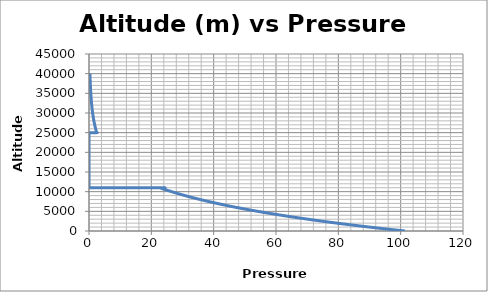
| Category | Series 0 |
|---|---|
| 101.40093090454886 | 0 |
| 101.28094498487972 | 10 |
| 101.16107405590193 | 20 |
| 101.04131803328688 | 30 |
| 100.92167683274836 | 40 |
| 100.80215037004369 | 50 |
| 100.68273856097235 | 60 |
| 100.56344132137707 | 70 |
| 100.44425856714335 | 80 |
| 100.32519021419927 | 90 |
| 100.20623617851601 | 100 |
| 100.08739637610712 | 110 |
| 99.96867072302925 | 120 |
| 99.85005913538177 | 130 |
| 99.73156152930656 | 140 |
| 99.61317782098857 | 150 |
| 99.49490792665505 | 160 |
| 99.37675176257623 | 170 |
| 99.25870924506508 | 180 |
| 99.14078029047698 | 190 |
| 99.02296481521033 | 200 |
| 98.90526273570573 | 210 |
| 98.78767396844674 | 220 |
| 98.67019842995971 | 230 |
| 98.5528360368131 | 240 |
| 98.43558670561848 | 250 |
| 98.31845035302948 | 260 |
| 98.20142689574286 | 270 |
| 98.08451625049776 | 280 |
| 97.96771833407557 | 290 |
| 97.85103306330072 | 300 |
| 97.73446035503963 | 310 |
| 97.61800012620178 | 320 |
| 97.50165229373893 | 330 |
| 97.38541677464511 | 340 |
| 97.26929348595722 | 350 |
| 97.15328234475433 | 360 |
| 97.03738326815814 | 370 |
| 96.92159617333286 | 380 |
| 96.8059209774848 | 390 |
| 96.69035759786307 | 400 |
| 96.57490595175894 | 410 |
| 96.45956595650632 | 420 |
| 96.34433752948117 | 430 |
| 96.2292205881021 | 440 |
| 96.11421504983004 | 450 |
| 95.99932083216812 | 460 |
| 95.884537852662 | 470 |
| 95.76986602889967 | 480 |
| 95.65530527851104 | 490 |
| 95.54085551916901 | 500 |
| 95.42651666858806 | 510 |
| 95.31228864452552 | 520 |
| 95.19817136478045 | 530 |
| 95.08416474719468 | 540 |
| 94.9702687096521 | 550 |
| 94.85648317007858 | 560 |
| 94.74280804644248 | 570 |
| 94.62924325675436 | 580 |
| 94.51578871906683 | 590 |
| 94.40244435147488 | 600 |
| 94.28921007211535 | 610 |
| 94.1760857991676 | 620 |
| 94.06307145085282 | 630 |
| 93.95016694543456 | 640 |
| 93.83737220121853 | 650 |
| 93.72468713655218 | 660 |
| 93.61211166982548 | 670 |
| 93.49964571947021 | 680 |
| 93.38728920396035 | 690 |
| 93.27504204181203 | 700 |
| 93.16290415158309 | 710 |
| 93.0508754518738 | 720 |
| 92.93895586132614 | 730 |
| 92.82714529862429 | 740 |
| 92.71544368249451 | 750 |
| 92.60385093170464 | 760 |
| 92.49236696506507 | 770 |
| 92.3809917014276 | 780 |
| 92.26972505968635 | 790 |
| 92.15856695877736 | 800 |
| 92.04751731767823 | 810 |
| 91.93657605540906 | 820 |
| 91.82574309103128 | 830 |
| 91.71501834364858 | 840 |
| 91.60440173240647 | 850 |
| 91.49389317649215 | 860 |
| 91.38349259513498 | 870 |
| 91.27319990760576 | 880 |
| 91.16301503321743 | 890 |
| 91.05293789132473 | 900 |
| 90.94296840132402 | 910 |
| 90.83310648265376 | 920 |
| 90.72335205479375 | 930 |
| 90.61370503726593 | 940 |
| 90.50416534963395 | 950 |
| 90.39473291150301 | 960 |
| 90.28540764252033 | 970 |
| 90.17618946237448 | 980 |
| 90.06707829079602 | 990 |
| 89.95807404755735 | 1000 |
| 89.84917665247204 | 1010 |
| 89.7403860253959 | 1020 |
| 89.63170208622586 | 1030 |
| 89.52312475490096 | 1040 |
| 89.4146539514018 | 1050 |
| 89.30628959575026 | 1060 |
| 89.19803160801028 | 1070 |
| 89.08987990828695 | 1080 |
| 88.9818344167274 | 1090 |
| 88.87389505352017 | 1100 |
| 88.76606173889513 | 1110 |
| 88.65833439312406 | 1120 |
| 88.55071293652004 | 1130 |
| 88.44319728943776 | 1140 |
| 88.33578737227357 | 1150 |
| 88.22848310546496 | 1160 |
| 88.1212844094913 | 1170 |
| 88.01419120487314 | 1180 |
| 87.90720341217272 | 1190 |
| 87.80032095199374 | 1200 |
| 87.69354374498106 | 1210 |
| 87.5868717118213 | 1220 |
| 87.48030477324228 | 1230 |
| 87.37384285001336 | 1240 |
| 87.26748586294536 | 1250 |
| 87.16123373289012 | 1260 |
| 87.05508638074141 | 1270 |
| 86.94904372743382 | 1280 |
| 86.8431056939436 | 1290 |
| 86.73727220128833 | 1300 |
| 86.63154317052675 | 1310 |
| 86.52591852275917 | 1320 |
| 86.4203981791268 | 1330 |
| 86.31498206081251 | 1340 |
| 86.20967008904037 | 1350 |
| 86.10446218507553 | 1360 |
| 85.99935827022469 | 1370 |
| 85.8943582658354 | 1380 |
| 85.78946209329676 | 1390 |
| 85.68466967403906 | 1400 |
| 85.57998092953358 | 1410 |
| 85.47539578129309 | 1420 |
| 85.37091415087117 | 1430 |
| 85.2665359598629 | 1440 |
| 85.16226112990441 | 1450 |
| 85.05808958267288 | 1460 |
| 84.95402123988683 | 1470 |
| 84.85005602330556 | 1480 |
| 84.74619385472974 | 1490 |
| 84.64243465600129 | 1500 |
| 84.53877834900271 | 1510 |
| 84.43522485565812 | 1520 |
| 84.33177409793214 | 1530 |
| 84.22842599783098 | 1540 |
| 84.12518047740167 | 1550 |
| 84.02203745873203 | 1560 |
| 83.91899686395134 | 1570 |
| 83.81605861522934 | 1580 |
| 83.71322263477728 | 1590 |
| 83.61048884484723 | 1600 |
| 83.5078571677319 | 1610 |
| 83.4053275257654 | 1620 |
| 83.30289984132247 | 1630 |
| 83.20057403681895 | 1640 |
| 83.09835003471161 | 1650 |
| 82.99622775749788 | 1660 |
| 82.89420712771638 | 1670 |
| 82.7922880679464 | 1680 |
| 82.69047050080832 | 1690 |
| 82.58875434896301 | 1700 |
| 82.48713953511253 | 1710 |
| 82.38562598199968 | 1720 |
| 82.28421361240795 | 1730 |
| 82.1829023491618 | 1740 |
| 82.08169211512649 | 1750 |
| 81.98058283320773 | 1760 |
| 81.8795744263526 | 1770 |
| 81.77866681754833 | 1780 |
| 81.67785992982337 | 1790 |
| 81.57715368624645 | 1800 |
| 81.47654800992747 | 1810 |
| 81.37604282401689 | 1820 |
| 81.27563805170564 | 1830 |
| 81.17533361622571 | 1840 |
| 81.07512944084934 | 1850 |
| 80.97502544888984 | 1860 |
| 80.87502156370108 | 1870 |
| 80.77511770867729 | 1880 |
| 80.67531380725366 | 1890 |
| 80.57560978290576 | 1900 |
| 80.47600555914993 | 1910 |
| 80.3765010595431 | 1920 |
| 80.27709620768256 | 1930 |
| 80.17779092720644 | 1940 |
| 80.07858514179323 | 1950 |
| 79.97947877516205 | 1960 |
| 79.88047175107268 | 1970 |
| 79.78156399332505 | 1980 |
| 79.68275542575999 | 1990 |
| 79.58404597225856 | 2000 |
| 79.48543555674246 | 2010 |
| 79.38692410317388 | 2020 |
| 79.28851153555519 | 2030 |
| 79.19019777792964 | 2040 |
| 79.0919827543805 | 2050 |
| 78.99386638903171 | 2060 |
| 78.89584860604764 | 2070 |
| 78.79792932963285 | 2080 |
| 78.70010848403258 | 2090 |
| 78.60238599353208 | 2100 |
| 78.50476178245728 | 2110 |
| 78.40723577517436 | 2120 |
| 78.30980789608975 | 2130 |
| 78.21247806965043 | 2140 |
| 78.11524622034335 | 2150 |
| 78.01811227269604 | 2160 |
| 77.92107615127631 | 2170 |
| 77.82413778069208 | 2180 |
| 77.72729708559179 | 2190 |
| 77.63055399066376 | 2200 |
| 77.5339084206369 | 2210 |
| 77.43736030028028 | 2220 |
| 77.34090955440303 | 2230 |
| 77.24455610785472 | 2240 |
| 77.14829988552484 | 2250 |
| 77.05214081234323 | 2260 |
| 76.9560788132801 | 2270 |
| 76.86011381334535 | 2280 |
| 76.76424573758946 | 2290 |
| 76.66847451110266 | 2300 |
| 76.57280005901569 | 2310 |
| 76.47722230649927 | 2320 |
| 76.38174117876397 | 2330 |
| 76.28635660106083 | 2340 |
| 76.19106849868065 | 2350 |
| 76.0958767969545 | 2360 |
| 76.00078142125352 | 2370 |
| 75.90578229698862 | 2380 |
| 75.81087934961104 | 2390 |
| 75.71607250461186 | 2400 |
| 75.62136168752224 | 2410 |
| 75.52674682391338 | 2420 |
| 75.43222783939628 | 2430 |
| 75.3378046596221 | 2440 |
| 75.24347721028178 | 2450 |
| 75.14924541710639 | 2460 |
| 75.0551092058669 | 2470 |
| 74.96106850237396 | 2480 |
| 74.86712323247848 | 2490 |
| 74.77327332207096 | 2500 |
| 74.679518697082 | 2510 |
| 74.5858592834821 | 2520 |
| 74.49229500728123 | 2530 |
| 74.39882579452981 | 2540 |
| 74.30545157131756 | 2550 |
| 74.2121722637743 | 2560 |
| 74.11898779806968 | 2570 |
| 74.02589810041299 | 2580 |
| 73.93290309705351 | 2590 |
| 73.84000271428002 | 2600 |
| 73.7471968784213 | 2610 |
| 73.65448551584589 | 2620 |
| 73.56186855296188 | 2630 |
| 73.46934591621735 | 2640 |
| 73.37691753209974 | 2650 |
| 73.28458332713653 | 2660 |
| 73.19234322789478 | 2670 |
| 73.10019716098114 | 2680 |
| 73.00814505304217 | 2690 |
| 72.91618683076372 | 2700 |
| 72.82432242087157 | 2710 |
| 72.73255175013112 | 2720 |
| 72.64087474534723 | 2730 |
| 72.5492913333646 | 2740 |
| 72.45780144106722 | 2750 |
| 72.36640499537887 | 2760 |
| 72.27510192326307 | 2770 |
| 72.18389215172246 | 2780 |
| 72.09277560779968 | 2790 |
| 72.00175221857646 | 2800 |
| 71.91082191117447 | 2810 |
| 71.8199846127548 | 2820 |
| 71.72924025051775 | 2830 |
| 71.6385887517035 | 2840 |
| 71.54803004359141 | 2850 |
| 71.45756405350058 | 2860 |
| 71.36719070878924 | 2870 |
| 71.27690993685532 | 2880 |
| 71.18672166513616 | 2890 |
| 71.09662582110833 | 2900 |
| 71.00662233228802 | 2910 |
| 70.9167111262308 | 2920 |
| 70.82689213053136 | 2930 |
| 70.73716527282413 | 2940 |
| 70.6475304807826 | 2950 |
| 70.55798768211986 | 2960 |
| 70.46853680458804 | 2970 |
| 70.37917777597885 | 2980 |
| 70.28991052412326 | 2990 |
| 70.20073497689141 | 3000 |
| 70.11165106219286 | 3010 |
| 70.02265870797649 | 3020 |
| 69.93375784223014 | 3030 |
| 69.84494839298138 | 3040 |
| 69.75623028829656 | 3050 |
| 69.6676034562816 | 3060 |
| 69.57906782508128 | 3070 |
| 69.49062332287998 | 3080 |
| 69.40226987790115 | 3090 |
| 69.31400741840714 | 3100 |
| 69.22583587269983 | 3110 |
| 69.13775516912011 | 3120 |
| 69.04976523604797 | 3130 |
| 68.9618660019027 | 3140 |
| 68.8740573951424 | 3150 |
| 68.78633934426463 | 3160 |
| 68.69871177780578 | 3170 |
| 68.6111746243415 | 3180 |
| 68.52372781248653 | 3190 |
| 68.4363712708944 | 3200 |
| 68.34910492825803 | 3210 |
| 68.2619287133091 | 3220 |
| 68.17484255481854 | 3230 |
| 68.08784638159625 | 3240 |
| 68.0009401224909 | 3250 |
| 67.91412370639047 | 3260 |
| 67.82739706222169 | 3270 |
| 67.74076011895038 | 3280 |
| 67.65421280558135 | 3290 |
| 67.56775505115809 | 3300 |
| 67.48138678476343 | 3310 |
| 67.39510793551872 | 3320 |
| 67.30891843258446 | 3330 |
| 67.22281820516002 | 3340 |
| 67.13680718248354 | 3350 |
| 67.05088529383221 | 3360 |
| 66.96505246852182 | 3370 |
| 66.87930863590722 | 3380 |
| 66.79365372538211 | 3390 |
| 66.70808766637884 | 3400 |
| 66.62261038836878 | 3410 |
| 66.53722182086183 | 3420 |
| 66.45192189340693 | 3430 |
| 66.36671053559174 | 3440 |
| 66.28158767704254 | 3450 |
| 66.19655324742463 | 3460 |
| 66.11160717644171 | 3470 |
| 66.02674939383645 | 3480 |
| 65.94197982939025 | 3490 |
| 65.85729841292303 | 3500 |
| 65.77270507429363 | 3510 |
| 65.6881997433993 | 3520 |
| 65.60378235017616 | 3530 |
| 65.51945282459909 | 3540 |
| 65.43521109668126 | 3550 |
| 65.35105709647483 | 3560 |
| 65.26699075407026 | 3570 |
| 65.18301199959691 | 3580 |
| 65.09912076322267 | 3590 |
| 65.0153169751538 | 3600 |
| 64.93160056563542 | 3610 |
| 64.84797146495099 | 3620 |
| 64.76442960342268 | 3630 |
| 64.68097491141121 | 3640 |
| 64.59760731931557 | 3650 |
| 64.5143267575736 | 3660 |
| 64.43113315666139 | 3670 |
| 64.34802644709366 | 3680 |
| 64.26500655942365 | 3690 |
| 64.18207342424283 | 3700 |
| 64.09922697218141 | 3710 |
| 64.01646713390782 | 3720 |
| 63.93379384012906 | 3730 |
| 63.8512070215906 | 3740 |
| 63.76870660907604 | 3750 |
| 63.686292533407695 | 3760 |
| 63.60396472544605 | 3770 |
| 63.52172311609007 | 3780 |
| 63.43956763627715 | 3790 |
| 63.35749821698271 | 3800 |
| 63.275514789221 | 3810 |
| 63.19361728404411 | 3820 |
| 63.11180563254274 | 3830 |
| 63.03007976584586 | 3840 |
| 62.94843961512059 | 3850 |
| 62.86688511157253 | 3860 |
| 62.785416186445296 | 3870 |
| 62.704032771020955 | 3880 |
| 62.62273479661981 | 3890 |
| 62.541522194600255 | 3900 |
| 62.46039489635909 | 3910 |
| 62.37935283333107 | 3920 |
| 62.29839593698939 | 3930 |
| 62.217524138845334 | 3940 |
| 62.136737370448294 | 3950 |
| 62.05603556338599 | 3960 |
| 61.97541864928403 | 3970 |
| 61.89488655980639 | 3980 |
| 61.8144392266551 | 3990 |
| 61.73407658157022 | 4000 |
| 61.65379855633011 | 4010 |
| 61.573605082750895 | 4020 |
| 61.49349609268702 | 4030 |
| 61.41347151803111 | 4040 |
| 61.33353129071345 | 4050 |
| 61.253675342702756 | 4060 |
| 61.1739036060054 | 4070 |
| 61.09421601266613 | 4080 |
| 61.0146124947676 | 4090 |
| 60.93509298443023 | 4100 |
| 60.85565741381271 | 4110 |
| 60.77630571511149 | 4120 |
| 60.6970378205612 | 4130 |
| 60.617853662434136 | 4140 |
| 60.53875317304073 | 4150 |
| 60.45973628472935 | 4160 |
| 60.38080292988611 | 4170 |
| 60.30195304093516 | 4180 |
| 60.22318655033855 | 4190 |
| 60.14450339059604 | 4200 |
| 60.06590349424545 | 4210 |
| 59.98738679386229 | 4220 |
| 59.90895322206011 | 4230 |
| 59.83060271149 | 4240 |
| 59.752335194841095 | 4250 |
| 59.674150604840314 | 4260 |
| 59.59604887425225 | 4270 |
| 59.51802993587936 | 4280 |
| 59.44009372256195 | 4290 |
| 59.362240167177795 | 4300 |
| 59.284469202642825 | 4310 |
| 59.206780761910316 | 4320 |
| 59.12917477797156 | 4330 |
| 59.05165118385526 | 4340 |
| 58.97420991262814 | 4350 |
| 58.89685089739449 | 4360 |
| 58.81957407129608 | 4370 |
| 58.74237936751261 | 4380 |
| 58.66526671926134 | 4390 |
| 58.588236059797076 | 4400 |
| 58.51128732241245 | 4410 |
| 58.43442044043743 | 4420 |
| 58.35763534723985 | 4430 |
| 58.28093197622498 | 4440 |
| 58.20431026083571 | 4450 |
| 58.12777013455262 | 4460 |
| 58.05131153089356 | 4470 |
| 57.97493438341421 | 4480 |
| 57.89863862570759 | 4490 |
| 57.822424191404366 | 4500 |
| 57.746291014172726 | 4510 |
| 57.67023902771814 | 4520 |
| 57.59426816578384 | 4530 |
| 57.51837836215033 | 4540 |
| 57.44256955063567 | 4550 |
| 57.36684166509544 | 4560 |
| 57.29119463942238 | 4570 |
| 57.21562840754706 | 4580 |
| 57.14014290343707 | 4590 |
| 57.06473806109765 | 4600 |
| 56.9894138145714 | 4610 |
| 56.91417009793819 | 4620 |
| 56.839006845315424 | 4630 |
| 56.76392399085764 | 4640 |
| 56.68892146875688 | 4650 |
| 56.61399921324255 | 4660 |
| 56.53915715858122 | 4670 |
| 56.46439523907695 | 4680 |
| 56.38971338907087 | 4690 |
| 56.315111542941594 | 4700 |
| 56.24058963510496 | 4710 |
| 56.16614760001399 | 4720 |
| 56.09178537215914 | 4730 |
| 56.01750288606778 | 4740 |
| 55.94330007630476 | 4750 |
| 55.86917687747222 | 4760 |
| 55.79513322420919 | 4770 |
| 55.721169051192206 | 4780 |
| 55.6472842931347 | 4790 |
| 55.573478884787434 | 4800 |
| 55.49975276093845 | 4810 |
| 55.426105856412626 | 4820 |
| 55.35253810607223 | 4830 |
| 55.279049444816415 | 4840 |
| 55.20563980758169 | 4850 |
| 55.13230912934158 | 4860 |
| 55.059057345106524 | 4870 |
| 54.98588438992427 | 4880 |
| 54.91279019887948 | 4890 |
| 54.839774707093895 | 4900 |
| 54.76683784972642 | 4910 |
| 54.6939795619727 | 4920 |
| 54.6211997790657 | 4930 |
| 54.548498436275175 | 4940 |
| 54.475875468907944 | 4950 |
| 54.403330812307935 | 4960 |
| 54.33086440185573 | 4970 |
| 54.25847617296915 | 4980 |
| 54.18616606110286 | 4990 |
| 54.11393400174844 | 5000 |
| 54.0417799304344 | 5010 |
| 53.969703782726135 | 5020 |
| 53.89770549422598 | 5030 |
| 53.82578500057318 | 5040 |
| 53.753942237443766 | 5050 |
| 53.68217714055068 | 5060 |
| 53.610489645643604 | 5070 |
| 53.53887968850934 | 5080 |
| 53.46734720497123 | 5090 |
| 53.395892130889536 | 5100 |
| 53.32451440216129 | 5110 |
| 53.25321395472036 | 5120 |
| 53.18199072453742 | 5130 |
| 53.11084464761983 | 5140 |
| 53.039775660011706 | 5150 |
| 52.96878369779394 | 5160 |
| 52.897868697084164 | 5170 |
| 52.82703059403676 | 5180 |
| 52.75626932484273 | 5190 |
| 52.685584825729805 | 5200 |
| 52.61497703296244 | 5210 |
| 52.544445882841714 | 5220 |
| 52.47399131170543 | 5230 |
| 52.40361325592794 | 5240 |
| 52.3333116519203 | 5250 |
| 52.26308643613022 | 5260 |
| 52.192937545041914 | 5270 |
| 52.12286491517634 | 5280 |
| 52.05286848309096 | 5290 |
| 51.982948185379755 | 5300 |
| 51.91310395867343 | 5310 |
| 51.843335739639095 | 5320 |
| 51.77364346498055 | 5330 |
| 51.70402707143794 | 5340 |
| 51.63448649578814 | 5350 |
| 51.56502167484437 | 5360 |
| 51.49563254545637 | 5370 |
| 51.42631904451046 | 5380 |
| 51.35708110892932 | 5390 |
| 51.28791867567218 | 5400 |
| 51.21883168173468 | 5410 |
| 51.14982006414884 | 5420 |
| 51.08088375998319 | 5430 |
| 51.012022706342705 | 5440 |
| 50.94323684036864 | 5450 |
| 50.87452609923873 | 5460 |
| 50.80589042016702 | 5470 |
| 50.73732974040402 | 5480 |
| 50.66884399723648 | 5490 |
| 50.60043312798763 | 5500 |
| 50.53209707001691 | 5510 |
| 50.463835760720045 | 5520 |
| 50.39564913752935 | 5530 |
| 50.32753713791304 | 5540 |
| 50.259499699375915 | 5550 |
| 50.19153675945891 | 5560 |
| 50.123648255739205 | 5570 |
| 50.05583412583042 | 5580 |
| 49.98809430738211 | 5590 |
| 49.92042873808033 | 5600 |
| 49.85283735564717 | 5610 |
| 49.785320097841044 | 5620 |
| 49.71787690245649 | 5630 |
| 49.65050770732419 | 5640 |
| 49.5832124503111 | 5650 |
| 49.51599106932023 | 5660 |
| 49.448843502290835 | 5670 |
| 49.38176968719821 | 5680 |
| 49.31476956205378 | 5690 |
| 49.24784306490514 | 5700 |
| 49.180990133835984 | 5710 |
| 49.114210706966006 | 5720 |
| 49.04750472245104 | 5730 |
| 48.98087211848293 | 5740 |
| 48.914312833289635 | 5750 |
| 48.84782680513516 | 5760 |
| 48.78141397231948 | 5770 |
| 48.71507427317859 | 5780 |
| 48.64880764608447 | 5790 |
| 48.582614029445175 | 5800 |
| 48.516493361704725 | 5810 |
| 48.45044558134304 | 5820 |
| 48.38447062687603 | 5830 |
| 48.31856843685549 | 5840 |
| 48.25273894986935 | 5850 |
| 48.186982104541244 | 5860 |
| 48.121297839530804 | 5870 |
| 48.05568609353353 | 5880 |
| 47.990146805280844 | 5890 |
| 47.92467991354007 | 5900 |
| 47.85928535711432 | 5910 |
| 47.7939630748426 | 5920 |
| 47.728713005599715 | 5930 |
| 47.663535088296356 | 5940 |
| 47.59842926187905 | 5950 |
| 47.53339546533004 | 5960 |
| 47.468433637667374 | 5970 |
| 47.403543717945006 | 5980 |
| 47.33872564525247 | 5990 |
| 47.273979358715216 | 6000 |
| 47.20930479749439 | 6010 |
| 47.1447019007868 | 6020 |
| 47.0801706078251 | 6030 |
| 47.01571085787755 | 6040 |
| 46.95132259024821 | 6050 |
| 46.88700574427674 | 6060 |
| 46.82276025933848 | 6070 |
| 46.758586074844516 | 6080 |
| 46.69448313024148 | 6090 |
| 46.630451365011766 | 6100 |
| 46.56649071867326 | 6110 |
| 46.5026011307796 | 6120 |
| 46.43878254091994 | 6130 |
| 46.375034888719014 | 6140 |
| 46.31135811383726 | 6150 |
| 46.24775215597053 | 6160 |
| 46.18421695485038 | 6170 |
| 46.120752450243806 | 6180 |
| 46.05735858195336 | 6190 |
| 45.99403528981716 | 6200 |
| 45.93078251370886 | 6210 |
| 45.86760019353753 | 6220 |
| 45.80448826924776 | 6230 |
| 45.74144668081961 | 6240 |
| 45.67847536826865 | 6250 |
| 45.6155742716459 | 6260 |
| 45.55274333103778 | 6270 |
| 45.489982486566156 | 6280 |
| 45.427291678388265 | 6290 |
| 45.36467084669691 | 6300 |
| 45.302119931720135 | 6310 |
| 45.239638873721425 | 6320 |
| 45.177227612999616 | 6330 |
| 45.11488608988886 | 6340 |
| 45.05261424475886 | 6350 |
| 44.990412018014425 | 6360 |
| 44.9282793500958 | 6370 |
| 44.866216181478485 | 6380 |
| 44.80422245267335 | 6390 |
| 44.74229810422657 | 6400 |
| 44.68044307671952 | 6410 |
| 44.618657310768874 | 6420 |
| 44.556940747026545 | 6430 |
| 44.495293326179734 | 6440 |
| 44.433714988950896 | 6450 |
| 44.372205676097636 | 6460 |
| 44.31076532841275 | 6470 |
| 44.249393886724356 | 6480 |
| 44.18809129189561 | 6490 |
| 44.12685748482498 | 6500 |
| 44.065692406446004 | 6510 |
| 44.00459599772736 | 6520 |
| 43.943568199672974 | 6530 |
| 43.88260895332175 | 6540 |
| 43.82171819974787 | 6550 |
| 43.76089588006045 | 6560 |
| 43.700141935403884 | 6570 |
| 43.639456306957484 | 6580 |
| 43.578838935935686 | 6590 |
| 43.518289763588065 | 6600 |
| 43.457808731199094 | 6610 |
| 43.39739578008842 | 6620 |
| 43.337050851610634 | 6630 |
| 43.276773887155315 | 6640 |
| 43.216564828147156 | 6650 |
| 43.15642361604571 | 6660 |
| 43.096350192345604 | 6670 |
| 43.03634449857636 | 6680 |
| 42.97640647630248 | 6690 |
| 42.91653606712341 | 6700 |
| 42.856733212673554 | 6710 |
| 42.796997854622205 | 6720 |
| 42.73732993467352 | 6730 |
| 42.677729394566605 | 6740 |
| 42.61819617607547 | 6750 |
| 42.558730221008936 | 6760 |
| 42.499331471210745 | 6770 |
| 42.43999986855943 | 6780 |
| 42.380735354968344 | 6790 |
| 42.32153787238584 | 6800 |
| 42.26240736279481 | 6810 |
| 42.20334376821319 | 6820 |
| 42.14434703069356 | 6830 |
| 42.085417092323276 | 6840 |
| 42.02655389522466 | 6850 |
| 41.96775738155449 | 6860 |
| 41.90902749350453 | 6870 |
| 41.85036417330114 | 6880 |
| 41.79176736320547 | 6890 |
| 41.73323700551335 | 6900 |
| 41.67477304255529 | 6910 |
| 41.61637541669654 | 6920 |
| 41.55804407033695 | 6930 |
| 41.49977894591113 | 6940 |
| 41.44157998588826 | 6950 |
| 41.383447132772154 | 6960 |
| 41.325380329101314 | 6970 |
| 41.26737951744886 | 6980 |
| 41.20944464042245 | 6990 |
| 41.15157564066436 | 7000 |
| 41.093772460851454 | 7010 |
| 41.03603504369518 | 7020 |
| 40.97836333194157 | 7030 |
| 40.92075726837113 | 7040 |
| 40.86321679579895 | 7050 |
| 40.80574185707455 | 7060 |
| 40.74833239508217 | 7070 |
| 40.690988352740376 | 7080 |
| 40.633709673002244 | 7090 |
| 40.576496298855346 | 7100 |
| 40.5193481733217 | 7110 |
| 40.462265239457885 | 7120 |
| 40.4052474403548 | 7130 |
| 40.34829471913779 | 7140 |
| 40.29140701896664 | 7150 |
| 40.23458428303556 | 7160 |
| 40.17782645457316 | 7170 |
| 40.12113347684239 | 7180 |
| 40.0645052931406 | 7190 |
| 40.00794184679947 | 7200 |
| 39.95144308118507 | 7210 |
| 39.895008939697824 | 7220 |
| 39.838639365772444 | 7230 |
| 39.78233430287791 | 7240 |
| 39.72609369451763 | 7250 |
| 39.66991748422917 | 7260 |
| 39.61380561558448 | 7270 |
| 39.55775803218974 | 7280 |
| 39.501774677685326 | 7290 |
| 39.445855495745974 | 7300 |
| 39.390000430080555 | 7310 |
| 39.33420942443224 | 7320 |
| 39.278482422578314 | 7330 |
| 39.22281936833038 | 7340 |
| 39.167220205534136 | 7350 |
| 39.11168487806946 | 7360 |
| 39.05621332985048 | 7370 |
| 39.00080550482533 | 7380 |
| 38.94546134697646 | 7390 |
| 38.89018080032031 | 7400 |
| 38.83496380890747 | 7410 |
| 38.77981031682268 | 7420 |
| 38.724720268184726 | 7430 |
| 38.669693607146534 | 7440 |
| 38.61473027789505 | 7450 |
| 38.559830224651236 | 7460 |
| 38.50499339167021 | 7470 |
| 38.450219723241105 | 7480 |
| 38.39550916368702 | 7490 |
| 38.34086165736508 | 7500 |
| 38.28627714866642 | 7510 |
| 38.2317555820162 | 7520 |
| 38.177296901873554 | 7530 |
| 38.12290105273153 | 7540 |
| 38.06856797911718 | 7550 |
| 38.0142976255914 | 7560 |
| 37.960089936749235 | 7570 |
| 37.905944857219446 | 7580 |
| 37.85186233166478 | 7590 |
| 37.79784230478186 | 7600 |
| 37.74388472130123 | 7610 |
| 37.68998952598729 | 7620 |
| 37.636156663638324 | 7630 |
| 37.582386079086405 | 7640 |
| 37.528677717197475 | 7650 |
| 37.47503152287134 | 7660 |
| 37.42144744104163 | 7670 |
| 37.3679254166757 | 7680 |
| 37.314465394774786 | 7690 |
| 37.2610673203738 | 7700 |
| 37.20773113854154 | 7710 |
| 37.15445679438054 | 7720 |
| 37.10124423302702 | 7730 |
| 37.048093399650945 | 7740 |
| 36.995004239456094 | 7750 |
| 36.94197669767983 | 7760 |
| 36.88901071959334 | 7770 |
| 36.83610625050141 | 7780 |
| 36.78326323574252 | 7790 |
| 36.730481620688884 | 7800 |
| 36.677761350746266 | 7810 |
| 36.62510237135418 | 7820 |
| 36.572504627985666 | 7830 |
| 36.519968066147484 | 7840 |
| 36.46749263137995 | 7850 |
| 36.41507826925694 | 7860 |
| 36.362724925386004 | 7870 |
| 36.310432545408204 | 7880 |
| 36.25820107499819 | 7890 |
| 36.20603045986417 | 7900 |
| 36.15392064574781 | 7910 |
| 36.10187157842446 | 7920 |
| 36.04988320370283 | 7930 |
| 35.99795546742524 | 7940 |
| 35.94608831546746 | 7950 |
| 35.89428169373871 | 7960 |
| 35.842535548181765 | 7970 |
| 35.7908498247728 | 7980 |
| 35.73922446952144 | 7990 |
| 35.687659428470766 | 8000 |
| 35.636154647697225 | 8010 |
| 35.584710073310795 | 8020 |
| 35.5333256514547 | 8030 |
| 35.48200132830573 | 8040 |
| 35.4307370500739 | 8050 |
| 35.37953276300262 | 8060 |
| 35.32838841336879 | 8070 |
| 35.27730394748246 | 8080 |
| 35.22627931168714 | 8090 |
| 35.17531445235961 | 8100 |
| 35.12440931590995 | 8110 |
| 35.07356384878164 | 8120 |
| 35.02277799745125 | 8130 |
| 34.97205170842882 | 8140 |
| 34.92138492825753 | 8150 |
| 34.87077760351388 | 8160 |
| 34.82022968080758 | 8170 |
| 34.76974110678152 | 8180 |
| 34.71931182811193 | 8190 |
| 34.66894179150812 | 8200 |
| 34.61863094371268 | 8210 |
| 34.568379231501346 | 8220 |
| 34.518186601682984 | 8230 |
| 34.46805300109968 | 8240 |
| 34.417978376626714 | 8250 |
| 34.367962675172365 | 8260 |
| 34.318005843678144 | 8270 |
| 34.2681078291186 | 8280 |
| 34.21826857850146 | 8290 |
| 34.16848803886751 | 8300 |
| 34.1187661572906 | 8310 |
| 34.06910288087766 | 8320 |
| 34.01949815676861 | 8330 |
| 33.969951932136595 | 8340 |
| 33.920464154187606 | 8350 |
| 33.87103477016074 | 8360 |
| 33.821663727328044 | 8370 |
| 33.77235097299465 | 8380 |
| 33.723096454498645 | 8390 |
| 33.67390011921106 | 8400 |
| 33.624761914535895 | 8410 |
| 33.57568178791011 | 8420 |
| 33.52665968680363 | 8430 |
| 33.47769555871931 | 8440 |
| 33.42878935119289 | 8450 |
| 33.379941011793 | 8460 |
| 33.331150488121196 | 8470 |
| 33.28241772781194 | 8480 |
| 33.23374267853255 | 8490 |
| 33.18512528798316 | 8500 |
| 33.1365655038968 | 8510 |
| 33.08806327403934 | 8520 |
| 33.039618546209425 | 8530 |
| 32.99123126823859 | 8540 |
| 32.94290138799112 | 8550 |
| 32.89462885336407 | 8560 |
| 32.84641361228734 | 8570 |
| 32.798255612723544 | 8580 |
| 32.75015480266811 | 8590 |
| 32.70211113014914 | 8600 |
| 32.654124543227546 | 8610 |
| 32.60619498999688 | 8620 |
| 32.558322418583444 | 8630 |
| 32.51050677714628 | 8640 |
| 32.46274801387705 | 8650 |
| 32.41504607700014 | 8660 |
| 32.36740091477258 | 8670 |
| 32.319812475484035 | 8680 |
| 32.272280707456865 | 8690 |
| 32.22480555904599 | 8700 |
| 32.17738697863904 | 8710 |
| 32.130024914656175 | 8720 |
| 32.08271931555015 | 8730 |
| 32.03547012980634 | 8740 |
| 31.988277305942745 | 8750 |
| 31.941140792509813 | 8760 |
| 31.894060538090596 | 8770 |
| 31.84703649130067 | 8780 |
| 31.800068600788176 | 8790 |
| 31.753156815233766 | 8800 |
| 31.70630108335055 | 8810 |
| 31.659501353884156 | 8820 |
| 31.612757575612672 | 8830 |
| 31.566069697346737 | 8840 |
| 31.519437667929374 | 8850 |
| 31.47286143623606 | 8860 |
| 31.426340951174677 | 8870 |
| 31.379876161685623 | 8880 |
| 31.333467016741665 | 8890 |
| 31.287113465347936 | 8900 |
| 31.240815456541995 | 8910 |
| 31.19457293939374 | 8920 |
| 31.148385863005487 | 8930 |
| 31.102254176511924 | 8940 |
| 31.056177829080006 | 8950 |
| 31.01015676990906 | 8960 |
| 30.964190948230726 | 8970 |
| 30.918280313308966 | 8980 |
| 30.87242481444007 | 8990 |
| 30.82662440095255 | 9000 |
| 30.780879022207195 | 9010 |
| 30.735188627597143 | 9020 |
| 30.689553166547675 | 9030 |
| 30.64397258851641 | 9040 |
| 30.598446842993123 | 9050 |
| 30.552975879499822 | 9060 |
| 30.507559647590778 | 9070 |
| 30.46219809685236 | 9080 |
| 30.41689117690323 | 9090 |
| 30.371638837394116 | 9100 |
| 30.326441028008 | 9110 |
| 30.281297698459937 | 9120 |
| 30.236208798497152 | 9130 |
| 30.191174277899034 | 9140 |
| 30.146194086477006 | 9150 |
| 30.101268174074665 | 9160 |
| 30.056396490567685 | 9170 |
| 30.011578985863768 | 9180 |
| 29.966815609902746 | 9190 |
| 29.922106312656517 | 9200 |
| 29.87745104412897 | 9210 |
| 29.83284975435607 | 9220 |
| 29.78830239340576 | 9230 |
| 29.743808911378057 | 9240 |
| 29.699369258404957 | 9250 |
| 29.65498338465043 | 9260 |
| 29.610651240310425 | 9270 |
| 29.566372775612834 | 9280 |
| 29.52214794081759 | 9290 |
| 29.477976686216458 | 9300 |
| 29.433858962133247 | 9310 |
| 29.389794718923586 | 9320 |
| 29.345783906975047 | 9330 |
| 29.301826476707184 | 9340 |
| 29.257922378571262 | 9350 |
| 29.214071563050602 | 9360 |
| 29.170273980660255 | 9370 |
| 29.1265295819472 | 9380 |
| 29.082838317490275 | 9390 |
| 29.03920013790002 | 9400 |
| 28.99561499381895 | 9410 |
| 28.952082835921267 | 9420 |
| 28.908603614913066 | 9430 |
| 28.865177281532144 | 9440 |
| 28.821803786548095 | 9450 |
| 28.77848308076231 | 9460 |
| 28.735215115007872 | 9470 |
| 28.691999840149666 | 9480 |
| 28.64883720708424 | 9490 |
| 28.605727166739882 | 9500 |
| 28.562669670076602 | 9510 |
| 28.519664668086094 | 9520 |
| 28.476712111791734 | 9530 |
| 28.43381195224853 | 9540 |
| 28.390964140543176 | 9550 |
| 28.34816862779403 | 9560 |
| 28.305425365151095 | 9570 |
| 28.262734303795952 | 9580 |
| 28.2200953949418 | 9590 |
| 28.177508589833437 | 9600 |
| 28.134973839747346 | 9610 |
| 28.092491095991463 | 9620 |
| 28.050060309905334 | 9630 |
| 28.007681432860057 | 9640 |
| 27.965354416258304 | 9650 |
| 27.923079211534272 | 9660 |
| 27.880855770153637 | 9670 |
| 27.83868404361364 | 9680 |
| 27.796563983442947 | 9690 |
| 27.754495541201784 | 9700 |
| 27.712478668481864 | 9710 |
| 27.6705133169063 | 9720 |
| 27.62859943812967 | 9730 |
| 27.586736983837994 | 9740 |
| 27.544925905748784 | 9750 |
| 27.503166155610916 | 9760 |
| 27.461457685204664 | 9770 |
| 27.419800446341707 | 9780 |
| 27.378194390865158 | 9790 |
| 27.336639470649416 | 9800 |
| 27.29513563760032 | 9810 |
| 27.253682843655035 | 9820 |
| 27.212281040782006 | 9830 |
| 27.170930180981117 | 9840 |
| 27.129630216283477 | 9850 |
| 27.088381098751558 | 9860 |
| 27.047182780479066 | 9870 |
| 27.006035213591055 | 9880 |
| 26.964938350243813 | 9890 |
| 26.923892142624858 | 9900 |
| 26.88289654295304 | 9910 |
| 26.84195150347837 | 9920 |
| 26.801056976482116 | 9930 |
| 26.76021291427677 | 9940 |
| 26.719419269205964 | 9950 |
| 26.678675993644617 | 9960 |
| 26.637983039998772 | 9970 |
| 26.597340360705655 | 9980 |
| 26.55674790823363 | 9990 |
| 26.516205635082187 | 10000 |
| 26.475713493782024 | 10010 |
| 26.435271436894947 | 10020 |
| 26.394879417013797 | 10030 |
| 26.354537386762583 | 10040 |
| 26.314245298796372 | 10050 |
| 26.274003105801338 | 10060 |
| 26.233810760494716 | 10070 |
| 26.19366821562479 | 10080 |
| 26.153575423970853 | 10090 |
| 26.11353233834325 | 10100 |
| 26.07353891158342 | 10110 |
| 26.033595096563715 | 10120 |
| 25.993700846187515 | 10130 |
| 25.953856113389172 | 10140 |
| 25.914060851134064 | 10150 |
| 25.874315012418496 | 10160 |
| 25.83461855026974 | 10170 |
| 25.79497141774598 | 10180 |
| 25.75537356793634 | 10190 |
| 25.71582495396089 | 10200 |
| 25.676325528970615 | 10210 |
| 25.636875246147337 | 10220 |
| 25.597474058703817 | 10230 |
| 25.55812191988364 | 10240 |
| 25.5188187829613 | 10250 |
| 25.47956460124215 | 10260 |
| 25.44035932806233 | 10270 |
| 25.40120291678881 | 10280 |
| 25.36209532081946 | 10290 |
| 25.32303649358285 | 10300 |
| 25.284026388538386 | 10310 |
| 25.245064959176304 | 10320 |
| 25.206152159017513 | 10330 |
| 25.167287941613786 | 10340 |
| 25.128472260547564 | 10350 |
| 25.089705069432057 | 10360 |
| 25.050986321911196 | 10370 |
| 25.01231597165966 | 10380 |
| 24.973693972382787 | 10390 |
| 24.935120277816612 | 10400 |
| 24.896594841727847 | 10410 |
| 24.8581176179139 | 10420 |
| 24.819688560202852 | 10430 |
| 24.781307622453372 | 10440 |
| 24.74297475855479 | 10450 |
| 24.704689922427036 | 10460 |
| 24.666453068020758 | 10470 |
| 24.628264149317086 | 10480 |
| 24.59012312032777 | 10490 |
| 24.552029935095167 | 10500 |
| 24.51398454769213 | 10510 |
| 24.475986912222204 | 10520 |
| 24.438036982819362 | 10530 |
| 24.400134713648143 | 10540 |
| 24.36228005890358 | 10550 |
| 24.32447297281129 | 10560 |
| 24.286713409627346 | 10570 |
| 24.249001323638282 | 10580 |
| 24.21133666916116 | 10590 |
| 24.173719400543444 | 10600 |
| 24.13614947216312 | 10610 |
| 24.098626838428597 | 10620 |
| 24.061151453778702 | 10630 |
| 24.023723272682652 | 10640 |
| 23.986342249640153 | 10650 |
| 23.949008339181216 | 10660 |
| 23.911721495866338 | 10670 |
| 23.874481674286297 | 10680 |
| 23.837288829062278 | 10690 |
| 23.800142914845836 | 10700 |
| 23.763043886318826 | 10710 |
| 23.725991698193475 | 10720 |
| 23.68898630521228 | 10730 |
| 23.652027662148093 | 10740 |
| 23.61511572380403 | 10750 |
| 23.5782504450135 | 10760 |
| 23.541431780640195 | 10770 |
| 23.504659685578044 | 10780 |
| 23.467934114751266 | 10790 |
| 23.431255023114296 | 10800 |
| 23.39462236565176 | 10810 |
| 23.35803609737858 | 10820 |
| 23.32149617333981 | 10830 |
| 23.28500254861077 | 10840 |
| 23.24855517829689 | 10850 |
| 23.212154017533784 | 10860 |
| 23.175799021487283 | 10870 |
| 23.13949014535334 | 10880 |
| 23.103227344358007 | 10890 |
| 23.067010573757496 | 10900 |
| 23.03083978883812 | 10910 |
| 22.994714944916318 | 10920 |
| 22.95863599733861 | 10930 |
| 22.922602901481593 | 10940 |
| 22.886615612751932 | 10950 |
| 22.850674086586338 | 10960 |
| 22.814778278451605 | 10970 |
| 22.77892814384456 | 10980 |
| 22.743123638292023 | 10990 |
| 22.707364717350817 | 11000 |
| 3.974784011471688e-06 | 11010 |
| 3.912867221113134e-06 | 11020 |
| 3.851914933207366e-06 | 11030 |
| 3.7919121233163127e-06 | 11040 |
| 3.7328440010435493e-06 | 11050 |
| 3.674696006388571e-06 | 11060 |
| 3.6174538061577506e-06 | 11070 |
| 3.5611032904313142e-06 | 11080 |
| 3.505630569085355e-06 | 11090 |
| 3.4510219683679085e-06 | 11100 |
| 3.397264027528492e-06 | 11110 |
| 3.3443434955000715e-06 | 11120 |
| 3.2922473276327877e-06 | 11130 |
| 3.240962682478439e-06 | 11140 |
| 3.1904769186251685e-06 | 11150 |
| 3.1407775915814498e-06 | 11160 |
| 3.0918524507085127e-06 | 11170 |
| 3.043689436200669e-06 | 11180 |
| 2.996276676112604e-06 | 11190 |
| 2.9496024834330476e-06 | 11200 |
| 2.9036553532039176e-06 | 11210 |
| 2.8584239596844355e-06 | 11220 |
| 2.8138971535594204e-06 | 11230 |
| 2.7700639591909744e-06 | 11240 |
| 2.726913571913073e-06 | 11250 |
| 2.6844353553682985e-06 | 11260 |
| 2.642618838885972e-06 | 11270 |
| 2.6014537149012227e-06 | 11280 |
| 2.5609298364142048e-06 | 11290 |
| 2.5210372144889495e-06 | 11300 |
| 2.4817660157910874e-06 | 11310 |
| 2.4431065601640064e-06 | 11320 |
| 2.4050493182427675e-06 | 11330 |
| 2.367584909105112e-06 | 11340 |
| 2.3307040979591343e-06 | 11350 |
| 2.2943977938669797e-06 | 11360 |
| 2.2586570475039188e-06 | 11370 |
| 2.22347304895242e-06 | 11380 |
| 2.188837125530531e-06 | 11390 |
| 2.154740739654136e-06 | 11400 |
| 2.1211754867324374e-06 | 11410 |
| 2.088133093096289e-06 | 11420 |
| 2.0556054139587997e-06 | 11430 |
| 2.023584431407639e-06 | 11440 |
| 1.9920622524286836e-06 | 11450 |
| 1.9610311069604497e-06 | 11460 |
| 1.930483345978768e-06 | 11470 |
| 1.9004114396113667e-06 | 11480 |
| 1.8708079752817795e-06 | 11490 |
| 1.841665655882211e-06 | 11500 |
| 1.8129772979747928e-06 | 11510 |
| 1.7847358300209253e-06 | 11520 |
| 1.7569342906381937e-06 | 11530 |
| 1.7295658268843865e-06 | 11540 |
| 1.702623692568296e-06 | 11550 |
| 1.6761012465868344e-06 | 11560 |
| 1.6499919512879986e-06 | 11570 |
| 1.624289370859395e-06 | 11580 |
| 1.5989871697418325e-06 | 11590 |
| 1.5740791110676597e-06 | 11600 |
| 1.549559055123375e-06 | 11610 |
| 1.525420957836235e-06 | 11620 |
| 1.5016588692844347e-06 | 11630 |
| 1.478266932230451e-06 | 11640 |
| 1.4552393806772767e-06 | 11650 |
| 1.4325705384471488e-06 | 11660 |
| 1.4102548177823643e-06 | 11670 |
| 1.3882867179679491e-06 | 11680 |
| 1.3666608239757469e-06 | 11690 |
| 1.3453718051296625e-06 | 11700 |
| 1.3244144137916455e-06 | 11710 |
| 1.3037834840681907e-06 | 11720 |
| 1.2834739305369818e-06 | 11730 |
| 1.263480746993334e-06 | 11740 |
| 1.2437990052162028e-06 | 11750 |
| 1.2244238537534147e-06 | 11760 |
| 1.2053505167257817e-06 | 11770 |
| 1.186574292649889e-06 | 11780 |
| 1.1680905532791927e-06 | 11790 |
| 1.149894742463198e-06 | 11800 |
| 1.1319823750243645e-06 | 11810 |
| 1.1143490356525453e-06 | 11820 |
| 1.0969903778166458e-06 | 11830 |
| 1.0799021226932032e-06 | 11840 |
| 1.0630800581116876e-06 | 11850 |
| 1.046520037516235e-06 | 11860 |
| 1.0302179789435196e-06 | 11870 |
| 1.0141698640165838e-06 | 11880 |
| 9.983717369543213e-07 | 11890 |
| 9.828197035964121e-07 | 11900 |
| 9.675099304434074e-07 | 11910 |
| 9.524386437118037e-07 | 11920 |
| 9.376021284038331e-07 | 11930 |
| 9.229967273917146e-07 | 11940 |
| 9.086188405161999e-07 | 11950 |
| 8.944649236991622e-07 | 11960 |
| 8.805314880699785e-07 | 11970 |
| 8.668150991055539e-07 | 11980 |
| 8.533123757837208e-07 | 11990 |
| 8.400199897498477e-07 | 12000 |
| 8.269346644963964e-07 | 12010 |
| 8.140531745552895e-07 | 12020 |
| 8.013723447028564e-07 | 12030 |
| 7.888890491771388e-07 | 12040 |
| 7.766002109074149e-07 | 12050 |
| 7.64502800755725e-07 | 12060 |
| 7.525938367701868e-07 | 12070 |
| 7.408703834499707e-07 | 12080 |
| 7.293295510217079e-07 | 12090 |
| 7.179684947271849e-07 | 12100 |
| 7.067844141221107e-07 | 12110 |
| 6.957745523858275e-07 | 12120 |
| 6.849361956417764e-07 | 12130 |
| 6.742666722885249e-07 | 12140 |
| 6.637633523412378e-07 | 12150 |
| 6.53423646783406e-07 | 12160 |
| 6.43245006928653e-07 | 12170 |
| 6.332249237925047e-07 | 12180 |
| 6.233609274739336e-07 | 12190 |
| 6.136505865465487e-07 | 12200 |
| 6.040915074592476e-07 | 12210 |
| 5.946813339462248e-07 | 12220 |
| 5.854177464461703e-07 | 12230 |
| 5.762984615304961e-07 | 12240 |
| 5.673212313404891e-07 | 12250 |
| 5.584838430332306e-07 | 12260 |
| 5.497841182361296e-07 | 12270 |
| 5.41219912509973e-07 | 12280 |
| 5.327891148203277e-07 | 12290 |
| 5.244896470171883e-07 | 12300 |
| 5.163194633227128e-07 | 12310 |
| 5.082765498269535e-07 | 12320 |
| 5.003589239914442e-07 | 12330 |
| 4.925646341605026e-07 | 12340 |
| 4.848917590801629e-07 | 12350 |
| 4.77338407424601e-07 | 12360 |
| 4.6990271732992203e-07 | 12370 |
| 4.6258285593522637e-07 | 12380 |
| 4.553770189308157e-07 | 12390 |
| 4.4828343011344576e-07 | 12400 |
| 4.413003409484915e-07 | 12410 |
| 4.344260301389465e-07 | 12420 |
| 4.2765880320113687e-07 | 12430 |
| 4.209969920470297e-07 | 12440 |
| 4.144389545730638e-07 | 12450 |
| 4.079830742553763e-07 | 12460 |
| 4.0162775975134374e-07 | 12470 |
| 3.9537144450731447e-07 | 12480 |
| 3.89212586372466e-07 | 12490 |
| 3.831496672186761e-07 | 12500 |
| 3.771811925663039e-07 | 12510 |
| 3.7130569121581155e-07 | 12520 |
| 3.6552171488512537e-07 | 12530 |
| 3.59827837852633e-07 | 12540 |
| 3.5422265660575583e-07 | 12550 |
| 3.4870478949498716e-07 | 12560 |
| 3.432728763933276e-07 | 12570 |
| 3.3792557836101286e-07 | 12580 |
| 3.326615773154755e-07 | 12590 |
| 3.2747957570644783e-07 | 12600 |
| 3.2237829619611483e-07 | 12610 |
| 3.173564813442602e-07 | 12620 |
| 3.1241289329831726e-07 | 12630 |
| 3.075463134882373e-07 | 12640 |
| 3.027555423261226e-07 | 12650 |
| 2.9803939891053196e-07 | 12660 |
| 2.933967207353986e-07 | 12670 |
| 2.8882636340347135e-07 | 12680 |
| 2.8432720034423007e-07 | 12690 |
| 2.798981225361944e-07 | 12700 |
| 2.7553803823354924e-07 | 12710 |
| 2.7124587269703813e-07 | 12720 |
| 2.6702056792904814e-07 | 12730 |
| 2.628610824128126e-07 | 12740 |
| 2.587663908556864e-07 | 12750 |
| 2.5473548393641487e-07 | 12760 |
| 2.5076736805634405e-07 | 12770 |
| 2.468610650944987e-07 | 12780 |
| 2.430156121664825e-07 | 12790 |
| 2.3923006138713505e-07 | 12800 |
| 2.35503479636877e-07 | 12810 |
| 2.3183494833170362e-07 | 12820 |
| 2.2822356319676085e-07 | 12830 |
| 2.2466843404344088e-07 | 12840 |
| 2.211686845499587e-07 | 12850 |
| 2.1772345204534098e-07 | 12860 |
| 2.1433188729678555e-07 | 12870 |
| 2.1099315430032476e-07 | 12880 |
| 2.0770643007475703e-07 | 12890 |
| 2.044709044587883e-07 | 12900 |
| 2.0128577991132678e-07 | 12910 |
| 1.9815027131489537e-07 | 12920 |
| 1.9506360578210592e-07 | 12930 |
| 1.9202502246514232e-07 | 12940 |
| 1.8903377236821792e-07 | 12950 |
| 1.8608911816295053e-07 | 12960 |
| 1.8319033400661724e-07 | 12970 |
| 1.8033670536323367e-07 | 12980 |
| 1.775275288274265e-07 | 12990 |
| 1.7476211195104946e-07 | 13000 |
| 1.720397730724943e-07 | 13010 |
| 1.693598411486666e-07 | 13020 |
| 1.667216555895788e-07 | 13030 |
| 1.6412456609551428e-07 | 13040 |
| 1.615679324967342e-07 | 13050 |
| 1.5905112459567763e-07 | 13060 |
| 1.5657352201162317e-07 | 13070 |
| 1.541345140277648e-07 | 13080 |
| 1.5173349944067504e-07 | 13090 |
| 1.4936988641211263e-07 | 13100 |
| 1.4704309232313435e-07 | 13110 |
| 1.4475254363048372e-07 | 13120 |
| 1.424976757252172e-07 | 13130 |
| 1.402779327935275e-07 | 13140 |
| 1.380927676797405e-07 | 13150 |
| 1.35941641751443e-07 | 13160 |
| 1.3382402476671448e-07 | 13170 |
| 1.31739394743422e-07 | 13180 |
| 1.2968723783055588e-07 | 13190 |
| 1.2766704818156926e-07 | 13200 |
| 1.256783278296865e-07 | 13210 |
| 1.237205865651585e-07 | 13220 |
| 1.2179334181442944e-07 | 13230 |
| 1.1989611852118237e-07 | 13240 |
| 1.1802844902924183e-07 | 13250 |
| 1.16189872967298e-07 | 13260 |
| 1.1437993713542926e-07 | 13270 |
| 1.1259819539338798e-07 | 13280 |
| 1.1084420855063056e-07 | 13290 |
| 1.091175442580602e-07 | 13300 |
| 1.074177769014527e-07 | 13310 |
| 1.0574448749654573e-07 | 13320 |
| 1.0409726358576252e-07 | 13330 |
| 1.024756991365408e-07 | 13340 |
| 1.0087939444124924e-07 | 13350 |
| 9.930795601866083e-08 | 13360 |
| 9.776099651696304e-08 | 13370 |
| 9.623813461827547e-08 | 13380 |
| 9.473899494465788e-08 | 13390 |
| 9.326320796558244e-08 | 13400 |
| 9.18104099068442e-08 | 13410 |
| 9.038024266089358e-08 | 13420 |
| 8.897235369856564e-08 | 13430 |
| 8.758639598218136e-08 | 13440 |
| 8.622202788000595e-08 | 13450 |
| 8.487891308203758e-08 | 13460 |
| 8.355672051710988e-08 | 13470 |
| 8.225512427128282e-08 | 13480 |
| 8.097380350750724e-08 | 13490 |
| 7.971244238654116e-08 | 13500 |
| 7.847072998909513e-08 | 13510 |
| 7.724836023919303e-08 | 13520 |
| 7.604503182872672e-08 | 13530 |
| 7.48604481431834e-08 | 13540 |
| 7.369431718853268e-08 | 13550 |
| 7.254635151925102e-08 | 13560 |
| 7.141626816746877e-08 | 13570 |
| 7.03037885732185e-08 | 13580 |
| 6.920863851577214e-08 | 13590 |
| 6.813054804604761e-08 | 13600 |
| 6.706925142006624e-08 | 13610 |
| 6.602448703344896e-08 | 13620 |
| 6.499599735693277e-08 | 13630 |
| 6.39835288728897e-08 | 13640 |
| 6.298683201283678e-08 | 13650 |
| 6.200566109591838e-08 | 13660 |
| 6.103977426834779e-08 | 13670 |
| 6.008893344379025e-08 | 13680 |
| 5.9152904244676415e-08 | 13690 |
| 5.823145594443019e-08 | 13700 |
| 5.732436141059441e-08 | 13710 |
| 5.6431397048844646e-08 | 13720 |
| 5.555234274787397e-08 | 13730 |
| 5.468698182513735e-08 | 13740 |
| 5.383510097343929e-08 | 13750 |
| 5.2996490208355266e-08 | 13760 |
| 5.217094281647215e-08 | 13770 |
| 5.135825530443326e-08 | 13780 |
| 5.05582273487788e-08 | 13790 |
| 4.9770661746567703e-08 | 13800 |
| 4.899536436676692e-08 | 13810 |
| 4.823214410239985e-08 | 13820 |
| 4.7480812823439076e-08 | 13830 |
| 4.6741185330433877e-08 | 13840 |
| 4.601307930885848e-08 | 13850 |
| 4.529631528417295e-08 | 13860 |
| 4.45907165775841e-08 | 13870 |
| 4.389610926249401e-08 | 13880 |
| 4.321232212162853e-08 | 13890 |
| 4.2539186604833505e-08 | 13900 |
| 4.187653678752706e-08 | 13910 |
| 4.1224209329800625e-08 | 13920 |
| 4.058204343615617e-08 | 13930 |
| 3.994988081587147e-08 | 13940 |
| 3.9327565643981385e-08 | 13950 |
| 3.8714944522868166e-08 | 13960 |
| 3.811186644445016e-08 | 13970 |
| 3.751818275295821e-08 | 13980 |
| 3.693374710829315e-08 | 13990 |
| 3.63584154499541e-08 | 14000 |
| 3.579204596152748e-08 | 14010 |
| 3.523449903573048e-08 | 14020 |
| 3.4685637239998266e-08 | 14030 |
| 3.4145325282608116e-08 | 14040 |
| 3.361342997932983e-08 | 14050 |
| 3.308982022059692e-08 | 14060 |
| 3.257436693918909e-08 | 14070 |
| 3.206694307841705e-08 | 14080 |
| 3.156742356080409e-08 | 14090 |
| 3.1075685257255396e-08 | 14100 |
| 3.0591606956706674e-08 | 14110 |
| 3.0115069336246643e-08 | 14120 |
| 2.964595493170437e-08 | 14130 |
| 2.918414810869528e-08 | 14140 |
| 2.8729535034117263e-08 | 14150 |
| 2.82820036480917e-08 | 14160 |
| 2.784144363634153e-08 | 14170 |
| 2.7407746402998726e-08 | 14180 |
| 2.6980805043836274e-08 | 14190 |
| 2.6560514319917084e-08 | 14200 |
| 2.614677063165252e-08 | 14210 |
| 2.573947199326602e-08 | 14220 |
| 2.5338518007653894e-08 | 14230 |
| 2.494380984163832e-08 | 14240 |
| 2.4555250201604903e-08 | 14250 |
| 2.417274330952055e-08 | 14260 |
| 2.3796194879324913e-08 | 14270 |
| 2.342551209368882e-08 | 14280 |
| 2.3060603581135537e-08 | 14290 |
| 2.2701379393518383e-08 | 14300 |
| 2.234775098384846e-08 | 14310 |
| 2.1999631184468595e-08 | 14320 |
| 2.1656934185566786e-08 | 14330 |
| 2.1319575514024788e-08 | 14340 |
| 2.0987472012595492e-08 | 14350 |
| 2.066054181940526e-08 | 14360 |
| 2.0338704347775617e-08 | 14370 |
| 2.00218802663586e-08 | 14380 |
| 1.9709991479582186e-08 | 14390 |
| 1.9402961108400318e-08 | 14400 |
| 1.9100713471342192e-08 | 14410 |
| 1.8803174065857426e-08 | 14420 |
| 1.851026954995141e-08 | 14430 |
| 1.8221927724107125e-08 | 14440 |
| 1.7938077513487936e-08 | 14450 |
| 1.7658648950418192e-08 | 14460 |
| 1.7383573157136717e-08 | 14470 |
| 1.711278232881841e-08 | 14480 |
| 1.6846209716860882e-08 | 14490 |
| 1.658378961243144e-08 | 14500 |
| 1.6325457330269805e-08 | 14510 |
| 1.6071149192743776e-08 | 14520 |
| 1.5820802514152873e-08 | 14530 |
| 1.557435558527686e-08 | 14540 |
| 1.5331747658164386e-08 | 14550 |
| 1.5092918931159084e-08 | 14560 |
| 1.485781053415891e-08 | 14570 |
| 1.4626364514104652e-08 | 14580 |
| 1.4398523820694922e-08 | 14590 |
| 1.4174232292323716e-08 | 14600 |
| 1.3953434642236532e-08 | 14610 |
| 1.3736076444902668e-08 | 14620 |
| 1.3522104122599496e-08 | 14630 |
| 1.3311464932206014e-08 | 14640 |
| 1.310410695220164e-08 | 14650 |
| 1.2899979069867944e-08 | 14660 |
| 1.269903096868978e-08 | 14670 |
| 1.2501213115952202e-08 | 14680 |
| 1.2306476750531073e-08 | 14690 |
| 1.211477387087378e-08 | 14700 |
| 1.1926057223166858e-08 | 14710 |
| 1.1740280289688308e-08 | 14720 |
| 1.155739727734114e-08 | 14730 |
| 1.1377363106365763e-08 | 14740 |
| 1.1200133399227786e-08 | 14750 |
| 1.1025664469679319e-08 | 14760 |
| 1.0853913311990633e-08 | 14770 |
| 1.0684837590349226e-08 | 14780 |
| 1.0518395628424383e-08 | 14790 |
| 1.0354546399094257e-08 | 14800 |
| 1.0193249514332683e-08 | 14810 |
| 1.0034465215253864e-08 | 14820 |
| 9.878154362311936e-09 | 14830 |
| 9.724278425653401e-09 | 14840 |
| 9.572799475619505e-09 | 14850 |
| 9.423680173396852e-09 | 14860 |
| 9.276883761813697e-09 | 14870 |
| 9.132374056279258e-09 | 14880 |
| 8.990115435864515e-09 | 14890 |
| 8.850072834521908e-09 | 14900 |
| 8.712211732441542e-09 | 14910 |
| 8.576498147542353e-09 | 14920 |
| 8.442898627095632e-09 | 14930 |
| 8.311380239479213e-09 | 14940 |
| 8.181910566059798e-09 | 14950 |
| 8.054457693202037e-09 | 14960 |
| 7.928990204402041e-09 | 14970 |
| 7.805477172543208e-09 | 14980 |
| 7.68388815227295e-09 | 14990 |
| 7.56419317249801e-09 | 15000 |
| 7.446362728996841e-09 | 15010 |
| 7.330367777146807e-09 | 15020 |
| 7.216179724764899e-09 | 15030 |
| 7.103770425059986e-09 | 15040 |
| 6.993112169694612e-09 | 15050 |
| 6.884177681955108e-09 | 15060 |
| 6.776940110028091e-09 | 15070 |
| 6.6713730203814685e-09 | 15080 |
| 6.567450391248813e-09 | 15090 |
| 6.46514660621507e-09 | 15100 |
| 6.364436447902334e-09 | 15110 |
| 6.265295091753747e-09 | 15120 |
| 6.167698099914445e-09 | 15130 |
| 6.071621415207801e-09 | 15140 |
| 5.977041355205333e-09 | 15150 |
| 5.883934606389154e-09 | 15160 |
| 5.792278218405378e-09 | 15170 |
| 5.70204959840684e-09 | 15180 |
| 5.613226505484154e-09 | 15190 |
| 5.525787045183402e-09 | 15200 |
| 5.439709664109334e-09 | 15210 |
| 5.354973144612448e-09 | 15220 |
| 5.2715565995589995e-09 | 15230 |
| 5.189439467182485e-09 | 15240 |
| 5.108601506015155e-09 | 15250 |
| 5.029022789898648e-09 | 15260 |
| 4.9506837030723465e-09 | 15270 |
| 4.873564935338077e-09 | 15280 |
| 4.797647477300317e-09 | 15290 |
| 4.722912615680437e-09 | 15300 |
| 4.649341928704035e-09 | 15310 |
| 4.5769172815599615e-09 | 15320 |
| 4.505620821930231e-09 | 15330 |
| 4.4354349755895546e-09 | 15340 |
| 4.366342442073291e-09 | 15350 |
| 4.298326190413013e-09 | 15360 |
| 4.231369454938502e-09 | 15370 |
| 4.165455731145004e-09 | 15380 |
| 4.100568771625009e-09 | 15390 |
| 4.036692582063319e-09 | 15400 |
| 3.973811417294582e-09 | 15410 |
| 3.911909777422105e-09 | 15420 |
| 3.850972403997243e-09 | 15430 |
| 3.790984276258312e-09 | 15440 |
| 3.731930607427965e-09 | 15450 |
| 3.67379684106836e-09 | 15460 |
| 3.616568647493113e-09 | 15470 |
| 3.5602319202350224e-09 | 15480 |
| 3.504772772568944e-09 | 15490 |
| 3.4501775340887597e-09 | 15500 |
| 3.3964327473377375e-09 | 15510 |
| 3.34352516449126e-09 | 15520 |
| 3.291441744091341e-09 | 15530 |
| 3.240169647832004e-09 | 15540 |
| 3.18969623739463e-09 | 15550 |
| 3.140009071332717e-09 | 15560 |
| 3.0910959020051496e-09 | 15570 |
| 3.0429446725571546e-09 | 15580 |
| 2.9955435139483877e-09 | 15590 |
| 2.948880742027255e-09 | 15600 |
| 2.902944854650865e-09 | 15610 |
| 2.857724528849748e-09 | 15620 |
| 2.81320861803683e-09 | 15630 |
| 2.7693861492598827e-09 | 15640 |
| 2.7262463204966888e-09 | 15650 |
| 2.683778497992423e-09 | 15660 |
| 2.6419722136385147e-09 | 15670 |
| 2.6008171623922513e-09 | 15680 |
| 2.560303199736678e-09 | 15690 |
| 2.5204203391800015e-09 | 15700 |
| 2.4811587497940094e-09 | 15710 |
| 2.4425087537907364e-09 | 15720 |
| 2.4044608241369686e-09 | 15730 |
| 2.367005582205901e-09 | 15740 |
| 2.3301337954652996e-09 | 15750 |
| 2.293836375201755e-09 | 15760 |
| 2.2581043742803827e-09 | 15770 |
| 2.2229289849393518e-09 | 15780 |
| 2.188301536618845e-09 | 15790 |
| 2.154213493823794e-09 | 15800 |
| 2.120656454019953e-09 | 15810 |
| 2.087622145562668e-09 | 15820 |
| 2.0551024256579833e-09 | 15830 |
| 2.0230892783555012e-09 | 15840 |
| 1.991574812572449e-09 | 15850 |
| 1.9605512601485857e-09 | 15860 |
| 1.930010973931412e-09 | 15870 |
| 1.8999464258911406e-09 | 15880 |
| 1.8703502052651038e-09 | 15890 |
| 1.8412150167310227e-09 | 15900 |
| 1.8125336786087732e-09 | 15910 |
| 1.7842991210900966e-09 | 15920 |
| 1.7565043844959483e-09 | 15930 |
| 1.7291426175609885e-09 | 15940 |
| 1.7022070757447427e-09 | 15950 |
| 1.6756911195691235e-09 | 15960 |
| 1.649588212981851e-09 | 15970 |
| 1.623891921745312e-09 | 15980 |
| 1.5985959118505745e-09 | 15990 |
| 1.573693947956077e-09 | 16000 |
| 1.5491798918506679e-09 | 16010 |
| 1.5250477009405338e-09 | 16020 |
| 1.5012914267597467e-09 | 16030 |
| 1.477905213504013e-09 | 16040 |
| 1.4548832965872144e-09 | 16050 |
| 1.4322200012204806e-09 | 16060 |
| 1.4099097410134e-09 | 16070 |
| 1.3879470165969687e-09 | 16080 |
| 1.3663264142680442e-09 | 16090 |
| 1.345042604654886e-09 | 16100 |
| 1.3240903414035081e-09 | 16110 |
| 1.3034644598844534e-09 | 16120 |
| 1.2831598759197488e-09 | 16130 |
| 1.2631715845296974e-09 | 16140 |
| 1.2434946586991459e-09 | 16150 |
| 1.224124248163019e-09 | 16160 |
| 1.2050555782107442e-09 | 16170 |
| 1.186283948509326e-09 | 16180 |
| 1.1678047319447112e-09 | 16190 |
| 1.149613373481242e-09 | 16200 |
| 1.1317053890388727e-09 | 16210 |
| 1.1140763643878437e-09 | 16220 |
| 1.0967219540606064e-09 | 16230 |
| 1.0796378802806989e-09 | 16240 |
| 1.062819931908272e-09 | 16250 |
| 1.0462639634020794e-09 | 16260 |
| 1.0299658937976154e-09 | 16270 |
| 1.0139217057011907e-09 | 16280 |
| 9.981274442996434e-10 | 16290 |
| 9.825792163855088e-10 | 16300 |
| 9.672731893973719e-10 | 16310 |
| 9.522055904751406e-10 | 16320 |
| 9.373727055300631e-10 | 16330 |
| 9.227708783292353e-10 | 16340 |
| 9.083965095943358e-10 | 16350 |
| 8.942460561144353e-10 | 16360 |
| 8.803160298726065e-10 | 16370 |
| 8.66602997186158e-10 | 16380 |
| 8.531035778602281e-10 | 16390 |
| 8.398144443545948e-10 | 16400 |
| 8.267323209634612e-10 | 16410 |
| 8.138539830079929e-10 | 16420 |
| 8.011762560414596e-10 | 16430 |
| 7.886960150667576e-10 | 16440 |
| 7.764101837660969e-10 | 16450 |
| 7.643157337427152e-10 | 16460 |
| 7.524096837743873e-10 | 16470 |
| 7.406890990785801e-10 | 16480 |
| 7.291510905890259e-10 | 16490 |
| 7.177928142435911e-10 | 16500 |
| 7.066114702832354e-10 | 16510 |
| 6.956043025618708e-10 | 16520 |
| 6.847685978669924e-10 | 16530 |
| 6.741016852508919e-10 | 16540 |
| 6.636009353722678e-10 | 16550 |
| 6.532637598481158e-10 | 16560 |
| 6.430876106156998e-10 | 16570 |
| 6.33069979304477e-10 | 16580 |
| 6.232083966177821e-10 | 16590 |
| 6.135004317241659e-10 | 16600 |
| 6.039436916582134e-10 | 16610 |
| 5.94535820730676e-10 | 16620 |
| 5.852744999478136e-10 | 16630 |
| 5.761574464397789e-10 | 16640 |
| 5.671824128978895e-10 | 16650 |
| 5.58347187020686e-10 | 16660 |
| 5.496495909686056e-10 | 16670 |
| 5.410874808271644e-10 | 16680 |
| 5.3265874607848e-10 | 16690 |
| 5.243613090810467e-10 | 16700 |
| 5.161931245576114e-10 | 16710 |
| 5.081521790910124e-10 | 16720 |
| 5.002364906278873e-10 | 16730 |
| 4.92444107990112e-10 | 16740 |
| 4.847731103938343e-10 | 16750 |
| 4.772216069760174e-10 | 16760 |
| 4.697877363283477e-10 | 16770 |
| 4.6246966603841366e-10 | 16780 |
| 4.552655922380155e-10 | 16790 |
| 4.4817373915852527e-10 | 16800 |
| 4.4119235869317335e-10 | 16810 |
| 4.343197299661395e-10 | 16820 |
| 4.2755415890837017e-10 | 16830 |
| 4.208939778400031e-10 | 16840 |
| 4.1433754505928394e-10 | 16850 |
| 4.078832444379002e-10 | 16860 |
| 4.015294850226112e-10 | 16870 |
| 3.9527470064309154e-10 | 16880 |
| 3.891173495258691e-10 | 16890 |
| 3.8305591391429e-10 | 16900 |
| 3.7708889969440324e-10 | 16910 |
| 3.7121483602666037e-10 | 16920 |
| 3.6543227498336545e-10 | 16930 |
| 3.5973979119177146e-10 | 16940 |
| 3.541359814827254e-10 | 16950 |
| 3.486194645447993e-10 | 16960 |
| 3.4318888058380066e-10 | 16970 |
| 3.3784289098759574e-10 | 16980 |
| 3.3258017799614005e-10 | 16990 |
| 3.2739944437666144e-10 | 17000 |
| 3.222994131039014e-10 | 17010 |
| 3.1727882704532804e-10 | 17020 |
| 3.123364486512628e-10 | 17030 |
| 3.0747105964983355e-10 | 17040 |
| 3.0268146074666996e-10 | 17050 |
| 2.97966471329288e-10 | 17060 |
| 2.9332492917607224e-10 | 17070 |
| 2.887556901697988e-10 | 17080 |
| 2.842576280156091e-10 | 17090 |
| 2.798296339633874e-10 | 17100 |
| 2.754706165344623e-10 | 17110 |
| 2.711795012525562e-10 | 17120 |
| 2.669552303789358e-10 | 17130 |
| 2.627967626516873e-10 | 17140 |
| 2.5870307302904464e-10 | 17150 |
| 2.546731524367258e-10 | 17160 |
| 2.507060075191989e-10 | 17170 |
| 2.4680066039482893e-10 | 17180 |
| 2.429561484148288e-10 | 17190 |
| 2.391715239259744e-10 | 17200 |
| 2.3544585403701504e-10 | 17210 |
| 2.3177822038871529e-10 | 17220 |
| 2.2816771892748664e-10 | 17230 |
| 2.2461345968254498e-10 | 17240 |
| 2.2111456654653243e-10 | 17250 |
| 2.1767017705956455e-10 | 17260 |
| 2.1427944219663643e-10 | 17270 |
| 2.109415261583454e-10 | 17280 |
| 2.0765560616486606e-10 | 17290 |
| 2.0442087225314135e-10 | 17300 |
| 2.01236527077233e-10 | 17310 |
| 1.981017857117749e-10 | 17320 |
| 1.9501587545849556e-10 | 17330 |
| 1.9197803565575366e-10 | 17340 |
| 1.8898751749103439e-10 | 17350 |
| 1.8604358381637398e-10 | 17360 |
| 1.831455089666547e-10 | 17370 |
| 1.802925785807347e-10 | 17380 |
| 1.7748408942535772e-10 | 17390 |
| 1.7471934922181143e-10 | 17400 |
| 1.71997676475286e-10 | 17410 |
| 1.693184003068853e-10 | 17420 |
| 1.6668086028826093e-10 | 17430 |
| 1.640844062788189e-10 | 17440 |
| 1.6152839826546537e-10 | 17450 |
| 1.5901220620484303e-10 | 17460 |
| 1.5653520986803047e-10 | 17470 |
| 1.5409679868766036e-10 | 17480 |
| 1.5169637160741422e-10 | 17490 |
| 1.4933333693386678e-10 | 17500 |
| 1.4700711219063802e-10 | 17510 |
| 1.4471712397481241e-10 | 17520 |
| 1.4246280781560013e-10 | 17530 |
| 1.4024360803519655e-10 | 17540 |
| 1.3805897761181275e-10 | 17550 |
| 1.3590837804483402e-10 | 17560 |
| 1.337912792220838e-10 | 17570 |
| 1.3170715928915504e-10 | 17580 |
| 1.296555045207728e-10 | 17590 |
| 1.2763580919416484e-10 | 17600 |
| 1.256475754644051e-10 | 17610 |
| 1.236903132416943e-10 | 17620 |
| 1.2176354007055724e-10 | 17630 |
| 1.19866781010919e-10 | 17640 |
| 1.179995685210363e-10 | 17650 |
| 1.16161442342248e-10 | 17660 |
| 1.1435194938552524e-10 | 17670 |
| 1.1257064361978818e-10 | 17680 |
| 1.1081708596195921e-10 | 17690 |
| 1.090908441687323e-10 | 17700 |
| 1.0739149273002842e-10 | 17710 |
| 1.0571861276410696e-10 | 17720 |
| 1.0407179191431511e-10 | 17730 |
| 1.024506242474431e-10 | 17740 |
| 1.0085471015366525e-10 | 17750 |
| 9.928365624803585e-11 | 17760 |
| 9.77370752735229e-11 | 17770 |
| 9.62145860055521e-11 | 17780 |
| 9.471581315803484e-11 | 17790 |
| 9.324038729086309e-11 | 17800 |
| 9.178794471884521e-11 | 17810 |
| 9.035812742205735e-11 | 17820 |
| 8.895058295759467e-11 | 17830 |
| 8.756496437269516e-11 | 17840 |
| 8.620093011921888e-11 | 17850 |
| 8.485814396945606e-11 | 17860 |
| 8.353627493324963e-11 | 17870 |
| 8.223499717640861e-11 | 17880 |
| 8.095398994038988e-11 | 17890 |
| 7.969293746323358e-11 | 17900 |
| 7.845152890173029e-11 | 17910 |
| 7.722945825479799e-11 | 17920 |
| 7.602642428805536e-11 | 17930 |
| 7.484213045956853e-11 | 17940 |
| 7.367628484675601e-11 | 17950 |
| 7.252860007442957e-11 | 17960 |
| 7.13987932439585e-11 | 17970 |
| 7.028658586353732e-11 | 17980 |
| 6.919170377953727e-11 | 17990 |
| 6.811387710892969e-11 | 18000 |
| 6.70528401727618e-11 | 18010 |
| 6.600833143066682e-11 | 18020 |
| 6.498009341639635e-11 | 18030 |
| 6.396787267435593e-11 | 18040 |
| 6.297141969713027e-11 | 18050 |
| 6.199048886397961e-11 | 18060 |
| 6.102483838029604e-11 | 18070 |
| 6.007423021800307e-11 | 18080 |
| 5.913843005688148e-11 | 18090 |
| 5.821720722681121e-11 | 18100 |
| 5.731033465091305e-11 | 18110 |
| 5.64175887895739e-11 | 18120 |
| 5.5538749585346293e-11 | 18130 |
| 5.4673600408704894e-11 | 18140 |
| 5.3821928004649165e-11 | 18150 |
| 5.2983522440135875e-11 | 18160 |
| 5.215817705233228e-11 | 18170 |
| 5.134568839767525e-11 | 18180 |
| 5.054585620172237e-11 | 18190 |
| 4.9758483309785816e-11 | 18200 |
| 4.89833756383352e-11 | 18210 |
| 4.8220342127155935e-11 | 18220 |
| 4.74691946922545e-11 | 18230 |
| 4.672974817949632e-11 | 18240 |
| 4.600182031896687e-11 | 18250 |
| 4.5285231680042035e-11 | 18260 |
| 4.4579805627159836e-11 | 18270 |
| 4.388536827628115e-11 | 18280 |
| 4.320174845202717e-11 | 18290 |
| 4.252877764548597e-11 | 18300 |
| 4.1866289972676406e-11 | 18310 |
| 4.121412213365758e-11 | 18320 |
| 4.0572113372276835e-11 | 18330 |
| 3.9940105436543834e-11 | 18340 |
| 3.9317942539622834e-11 | 18350 |
| 3.870547132143114e-11 | 18360 |
| 3.810254081083699e-11 | 18370 |
| 3.750900238844638e-11 | 18380 |
| 3.6924709749968263e-11 | 18390 |
| 3.634951887015169e-11 | 18400 |
| 3.5783287967284674e-11 | 18410 |
| 3.522587746824493e-11 | 18420 |
| 3.467714997409629e-11 | 18430 |
| 3.413697022622031e-11 | 18440 |
| 3.360520507297616e-11 | 18450 |
| 3.30817234368787e-11 | 18460 |
| 3.256639628228886e-11 | 18470 |
| 3.205909658360736e-11 | 18480 |
| 3.1559699293962825e-11 | 18490 |
| 3.106808131438869e-11 | 18500 |
| 3.0584121463480245e-11 | 18510 |
| 3.010770044752338e-11 | 18520 |
| 2.963870083108968e-11 | 18530 |
| 2.917700700808896e-11 | 18540 |
| 2.872250517327338e-11 | 18550 |
| 2.827508329418436e-11 | 18560 |
| 2.783463108353746e-11 | 18570 |
| 2.7401039972037395e-11 | 18580 |
| 2.6974203081615657e-11 | 18590 |
| 2.6554015199085884e-11 | 18600 |
| 2.6140372750209645e-11 | 18610 |
| 2.5733173774165267e-11 | 18620 |
| 2.5332317898415443e-11 | 18630 |
| 2.493770631396568e-11 | 18640 |
| 2.4549241751008716e-11 | 18650 |
| 2.4166828454947495e-11 | 18660 |
| 2.3790372162792367e-11 | 18670 |
| 2.341978007992599e-11 | 18680 |
| 2.305496085722941e-11 | 18690 |
| 2.269582456856529e-11 | 18700 |
| 2.2342282688611393e-11 | 18710 |
| 2.199424807103986e-11 | 18720 |
| 2.165163492703557e-11 | 18730 |
| 2.1314358804149876e-11 | 18740 |
| 2.0982336565483724e-11 | 18750 |
| 2.0655486369194348e-11 | 18760 |
| 2.0333727648321903e-11 | 18770 |
| 2.001698109093031e-11 | 18780 |
| 1.970516862055683e-11 | 18790 |
| 1.9398213376966886e-11 | 18800 |
| 1.909603969720826e-11 | 18810 |
| 1.879857309696081e-11 | 18820 |
| 1.850574025217605e-11 | 18830 |
| 1.821746898100336e-11 | 18840 |
| 1.7933688225997666e-11 | 18850 |
| 1.7654328036603782e-11 | 18860 |
| 1.7379319551914114e-11 | 18870 |
| 1.710859498369499e-11 | 18880 |
| 1.6842087599676808e-11 | 18890 |
| 1.6579731707105113e-11 | 18900 |
| 1.6321462636547537e-11 | 18910 |
| 1.6067216725953343e-11 | 18920 |
| 1.5816931304960682e-11 | 18930 |
| 1.5570544679448848e-11 | 18940 |
| 1.5327996116331134e-11 | 18950 |
| 1.5089225828584104e-11 | 18960 |
| 1.4854174960510545e-11 | 18970 |
| 1.4622785573231995e-11 | 18980 |
| 1.4395000630406771e-11 | 18990 |
| 1.4170763984171005e-11 | 19000 |
| 1.3950020361298374e-11 | 19010 |
| 1.373271534957572e-11 | 19020 |
| 1.3518795384390399e-11 | 19030 |
| 1.3308207735527042e-11 | 19040 |
| 1.3100900494169934e-11 | 19050 |
| 1.2896822560107478e-11 | 19060 |
| 1.269592362913639e-11 | 19070 |
| 1.2498154180662076e-11 | 19080 |
| 1.2303465465491803e-11 | 19090 |
| 1.2111809493818428e-11 | 19100 |
| 1.192313902339107e-11 | 19110 |
| 1.1737407547870293e-11 | 19120 |
| 1.1554569285364263e-11 | 19130 |
| 1.1374579167143876e-11 | 19140 |
| 1.1197392826533658e-11 | 19150 |
| 1.102296658797535e-11 | 19160 |
| 1.0851257456262226e-11 | 19170 |
| 1.0682223105941095e-11 | 19180 |
| 1.0515821870879061e-11 | 19190 |
| 1.0352012733993183e-11 | 19200 |
| 1.0190755317139878e-11 | 19210 |
| 1.003200987116207e-11 | 19220 |
| 9.875737266090993e-12 | 19230 |
| 9.721898981500954e-12 | 19240 |
| 9.57045709701435e-12 | 19250 |
| 9.421374282954262e-12 | 19260 |
| 9.274613791142993e-12 | 19270 |
| 9.130139445843912e-12 | 19280 |
| 8.987915634844117e-12 | 19290 |
| 8.847907300676333e-12 | 19300 |
| 8.710079931977359e-12 | 19310 |
| 8.574399554981303e-12 | 19320 |
| 8.44083272514504e-12 | 19330 |
| 8.309346518904385e-12 | 19340 |
| 8.179908525558684e-12 | 19350 |
| 8.052486839281565e-12 | 19360 |
| 7.927050051256394e-12 | 19370 |
| 7.80356724193424e-12 | 19380 |
| 7.682007973412197e-12 | 19390 |
| 7.56234228193069e-12 | 19400 |
| 7.444540670487515e-12 | 19410 |
| 7.328574101567072e-12 | 19420 |
| 7.2144139899826065e-12 | 19430 |
| 7.1020321958301795e-12 | 19440 |
| 6.991401017552392e-12 | 19450 |
| 6.8824931851099455e-12 | 19460 |
| 6.775281853259778e-12 | 19470 |
| 6.669740594937924e-12 | 19480 |
| 6.565843394745224e-12 | 19490 |
| 6.463564642534755e-12 | 19500 |
| 6.3628791270990095e-12 | 19510 |
| 6.263762029955547e-12 | 19520 |
| 6.166188919229225e-12 | 19530 |
| 6.07013574362993e-12 | 19540 |
| 5.9755788265241235e-12 | 19550 |
| 5.882494860098528e-12 | 19560 |
| 5.79086089961494e-12 | 19570 |
| 5.700654357754525e-12 | 19580 |
| 5.6118529990500314e-12 | 19590 |
| 5.524434934404935e-12 | 19600 |
| 5.438378615697852e-12 | 19610 |
| 5.3536628304711075e-12 | 19620 |
| 5.270266696701852e-12 | 19630 |
| 5.188169657654809e-12 | 19640 |
| 5.107351476815187e-12 | 19650 |
| 5.0277922329003814e-12 | 19660 |
| 4.949472314949519e-12 | 19670 |
| 4.872372417489516e-12 | 19680 |
| 4.79647353577626e-12 | 19690 |
| 4.721756961110109e-12 | 19700 |
| 4.6482042762242576e-12 | 19710 |
| 4.575797350745032e-12 | 19720 |
| 4.504518336722747e-12 | 19730 |
| 4.434349664232324e-12 | 19740 |
| 4.3652740370424394e-12 | 19750 |
| 4.297274428351988e-12 | 19760 |
| 4.230334076593118e-12 | 19770 |
| 4.164436481299626e-12 | 19780 |
| 4.099565399039582e-12 | 19790 |
| 4.035704839411469e-12 | 19800 |
| 3.972839061102593e-12 | 19810 |
| 3.910952568008989e-12 | 19820 |
| 3.85003010541562e-12 | 19830 |
| 3.790056656236206e-12 | 19840 |
| 3.731017437311634e-12 | 19850 |
| 3.672897895765891e-12 | 19860 |
| 3.6156837054189146e-12 | 19870 |
| 3.5593607632552288e-12 | 19880 |
| 3.5039151859476735e-12 | 19890 |
| 3.4493333064351563e-12 | 19900 |
| 3.3956016705538274e-12 | 19910 |
| 3.3427070337207316e-12 | 19920 |
| 3.2906363576690105e-12 | 19930 |
| 3.2393768072340693e-12 | 19940 |
| 3.1889157471898115e-12 | 19950 |
| 3.139240739134042e-12 | 19960 |
| 3.0903395384225137e-12 | 19970 |
| 3.0422000911506576e-12 | 19980 |
| 2.9948105311824e-12 | 19990 |
| 2.948159177225154e-12 | 20000 |
| 2.902234529950468e-12 | 20010 |
| 2.857025269159534e-12 | 20020 |
| 2.8125202509927467e-12 | 20030 |
| 2.768708505182833e-12 | 20040 |
| 2.725579232350763e-12 | 20050 |
| 2.6831218013436957e-12 | 20060 |
| 2.641325746614494e-12 | 20070 |
| 2.6001807656419987e-12 | 20080 |
| 2.559676716391545e-12 | 20090 |
| 2.519803614814946e-12 | 20100 |
| 2.4805516323895014e-12 | 20110 |
| 2.4419110936953427e-12 | 20120 |
| 2.403872474030435e-12 | 20130 |
| 2.366426397062813e-12 | 20140 |
| 2.3295636325193873e-12 | 20150 |
| 2.293275093910675e-12 | 20160 |
| 2.2575518362910602e-12 | 20170 |
| 2.222385054053892e-12 | 20180 |
| 2.187766078760978e-12 | 20190 |
| 2.153686377005809e-12 | 20200 |
| 2.120137548310141e-12 | 20210 |
| 2.087111323053342e-12 | 20220 |
| 2.054599560433923e-12 | 20230 |
| 2.022594246462897e-12 | 20240 |
| 1.9910874919883906e-12 | 20250 |
| 1.9600715307509617e-12 | 20260 |
| 1.9295387174692875e-12 | 20270 |
| 1.899481525955622e-12 | 20280 |
| 1.869892547260659e-12 | 20290 |
| 1.84076448784722e-12 | 20300 |
| 1.8120901677924535e-12 | 20310 |
| 1.78386251901804e-12 | 20320 |
| 1.7560745835479053e-12 | 20330 |
| 1.7287195117931354e-12 | 20340 |
| 1.7017905608636022e-12 | 20350 |
| 1.67528109290584e-12 | 20360 |
| 1.6491845734668703e-12 | 20370 |
| 1.62349456988348e-12 | 20380 |
| 1.5982047496966197e-12 | 20390 |
| 1.5733088790904762e-12 | 20400 |
| 1.5488008213558299e-12 | 20410 |
| 1.524674535377464e-12 | 20420 |
| 1.5009240741449709e-12 | 20430 |
| 1.4775435832869198e-12 | 20440 |
| 1.4545272996277509e-12 | 20450 |
| 1.4318695497671486e-12 | 20460 |
| 1.4095647486816417e-12 | 20470 |
| 1.3876073983478872e-12 | 20480 |
| 1.365992086387408e-12 | 20490 |
| 1.3447134847325277e-12 | 20500 |
| 1.3237663483129969e-12 | 20510 |
| 1.303145513763082e-12 | 20520 |
| 1.282845898148878e-12 | 20530 |
| 1.262862497715361e-12 | 20540 |
| 1.2431903866529613e-12 | 20550 |
| 1.223824715883429e-12 | 20560 |
| 1.2047607118645337e-12 | 20570 |
| 1.1859936754133833e-12 | 20580 |
| 1.1675189805481515e-12 | 20590 |
| 1.1493320733477686e-12 | 20600 |
| 1.1314284708293799e-12 | 20610 |
| 1.1138037598433676e-12 | 20620 |
| 1.0964535959854686e-12 | 20630 |
| 1.0793737025259547e-12 | 20640 |
| 1.062559869355417e-12 | 20650 |
| 1.0460079519469706e-12 | 20660 |
| 1.0297138703346968e-12 | 20670 |
| 1.0136736081079265e-12 | 20680 |
| 9.978832114211945e-13 | 20690 |
| 9.823387880196798e-13 | 20700 |
| 9.670365062797612e-13 | 20710 |
| 9.51972594264521e-13 | 20720 |
| 9.37143338794023e-13 | 20730 |
| 9.225450845300094e-13 | 20740 |
| 9.081742330748608e-13 | 20750 |
| 8.940272420846467e-13 | 20760 |
| 8.801006243959359e-13 | 20770 |
| 8.66390947166209e-13 | 20780 |
| 8.528948310277179e-13 | 20790 |
| 8.396089492544688e-13 | 20800 |
| 8.265300269421827e-13 | 20810 |
| 8.136548402010904e-13 | 20820 |
| 8.009802153612112e-13 | 20830 |
| 7.885030281901006e-13 | 20840 |
| 7.762202031227247e-13 | 20850 |
| 7.641287125033314e-13 | 20860 |
| 7.522255758391828e-13 | 20870 |
| 7.405078590658601e-13 | 20880 |
| 7.289726738240169e-13 | 20890 |
| 7.176171767474437e-13 | 20900 |
| 7.064385687621767e-13 | 20910 |
| 6.954340943965244e-13 | 20920 |
| 6.846010411018882e-13 | 20930 |
| 6.73936738584117e-13 | 20940 |
| 6.634385581452783e-13 | 20950 |
| 6.531039120357271e-13 | 20960 |
| 6.429302528162221e-13 | 20970 |
| 6.329150727299827e-13 | 20980 |
| 6.230559030845654e-13 | 20990 |
| 6.133503136433304e-13 | 21000 |
| 6.037959120263866e-13 | 21010 |
| 5.943903431209126e-13 | 21020 |
| 5.851312885005987e-13 | 21030 |
| 5.760164658541959e-13 | 21040 |
| 5.670436284229241e-13 | 21050 |
| 5.582105644466462e-13 | 21060 |
| 5.495150966187035e-13 | 21070 |
| 5.409550815492084e-13 | 21080 |
| 5.325284092366982e-13 | 21090 |
| 5.242330025480527e-13 | 21100 |
| 5.160668167064803e-13 | 21110 |
| 5.080278387874787e-13 | 21120 |
| 5.001140872226819e-13 | 21130 |
| 4.923236113114015e-13 | 21140 |
| 4.846544907397788e-13 | 21150 |
| 4.771048351074577e-13 | 21160 |
| 4.696727834615999e-13 | 21170 |
| 4.623565038381586e-13 | 21180 |
| 4.551541928103328e-13 | 21190 |
| 4.4806407504400414e-13 | 21200 |
| 4.4108440286014947e-13 | 21210 |
| 4.342134558040362e-13 | 21220 |
| 4.2744954022112947e-13 | 21230 |
| 4.207909888396337e-13 | 21240 |
| 4.1423616035950857e-13 | 21250 |
| 4.07783439047888e-13 | 21260 |
| 4.014312343408277e-13 | 21270 |
| 3.951779804512302e-13 | 21280 |
| 3.890221359828772e-13 | 21290 |
| 3.8296218355050077e-13 | 21300 |
| 3.769966294057461e-13 | 21310 |
| 3.7112400306896187e-13 | 21320 |
| 3.6534285696675136e-13 | 21330 |
| 3.596517660751434e-13 | 21340 |
| 3.540493275683241e-13 | 21350 |
| 3.485341604728627e-13 | 21360 |
| 3.431049053273e-13 | 21370 |
| 3.37760223847041e-13 | 21380 |
| 3.3249879859449176e-13 | 21390 |
| 3.2731933265429755e-13 | 21400 |
| 3.2222054931367665e-13 | 21410 |
| 3.1720119174770985e-13 | 21420 |
| 3.122600227095325e-13 | 21430 |
| 3.073958242253726e-13 | 21440 |
| 3.0260739729431986e-13 | 21450 |
| 2.978935615927712e-13 | 21460 |
| 2.932531551834998e-13 | 21470 |
| 2.8868503422923685e-13 | 21480 |
| 2.841880727107141e-13 | 21490 |
| 2.797611621491221e-13 | 21500 |
| 2.7540321133286346e-13 | 21510 |
| 2.711131460485725e-13 | 21520 |
| 2.6688990881633803e-13 | 21530 |
| 2.6273245862903363e-13 | 21540 |
| 2.586397706957091e-13 | 21550 |
| 2.546108361889958e-13 | 21560 |
| 2.506446619964297e-13 | 21570 |
| 2.4674027047564933e-13 | 21580 |
| 2.428966992134236e-13 | 21590 |
| 2.3911300078840803e-13 | 21600 |
| 2.3538824253762223e-13 | 21610 |
| 2.3172150632654754e-13 | 21620 |
| 2.2811188832280677e-13 | 21630 |
| 2.245584987733838e-13 | 21640 |
| 2.2106046178529872e-13 | 21650 |
| 2.176169151097002e-13 | 21660 |
| 2.1422700992933453e-13 | 21670 |
| 2.1088991064931164e-13 | 21680 |
| 2.076047946911308e-13 | 21690 |
| 2.0437085228992796e-13 | 21700 |
| 2.0118728629486812e-13 | 21710 |
| 1.9805331197264739e-13 | 21720 |
| 1.9496815681406874e-13 | 21730 |
| 1.9193106034361792e-13 | 21740 |
| 1.889412739320059e-13 | 21750 |
| 1.859980606116437e-13 | 21760 |
| 1.8310069489497937e-13 | 21770 |
| 1.8024846259566496e-13 | 21780 |
| 1.7744066065252232e-13 | 21790 |
| 1.7467659695623164e-13 | 21800 |
| 1.719555901787388e-13 | 21810 |
| 1.6927696960530753e-13 | 21820 |
| 1.6664007496918805e-13 | 21830 |
| 1.6404425628887172e-13 | 21840 |
| 1.614888737078701e-13 | 21850 |
| 1.5897329733699023e-13 | 21860 |
| 1.564969070990769e-13 | 21870 |
| 1.5405909257616307e-13 | 21880 |
| 1.5165925285900181e-13 | 21890 |
| 1.4929679639895155e-13 | 21900 |
| 1.46971140862159e-13 | 21910 |
| 1.4468171298601374e-13 | 21920 |
| 1.4242794843784786e-13 | 21930 |
| 1.402092916758277e-13 | 21940 |
| 1.3802519581201263e-13 | 21950 |
| 1.3587512247755577e-13 | 21960 |
| 1.337585416899957e-13 | 21970 |
| 1.316749317226156e-13 | 21980 |
| 1.296237789758469e-13 | 21990 |
| 1.276045778506619e-13 | 22000 |
| 1.256168306239526e-13 | 22010 |
| 1.2366004732584176e-13 | 22020 |
| 1.2173374561890495e-13 | 22030 |
| 1.1983745067928218e-13 | 22040 |
| 1.1797069507963336e-13 | 22050 |
| 1.161330186739174e-13 | 22060 |
| 1.1432396848397344e-13 | 22070 |
| 1.1254309858786152e-13 | 22080 |
| 1.1078997000994247e-13 | 22090 |
| 1.0906415061267761e-13 | 22100 |
| 1.0736521499010634e-13 | 22110 |
| 1.0569274436298359e-13 | 22120 |
| 1.0404632647555728e-13 | 22130 |
| 1.02425555493947e-13 | 22140 |
| 1.0083003190610578e-13 | 22150 |
| 9.925936242334686e-14 | 22160 |
| 9.771315988339757e-14 | 22170 |
| 9.619104315496379e-14 | 22180 |
| 9.469263704378776e-14 | 22190 |
| 9.321757220015919e-14 | 22200 |
| 9.176548502787693e-14 | 22210 |
| 9.03360175946224e-14 | 22220 |
| 8.892881754372909e-14 | 22230 |
| 8.754353800733222e-14 | 22240 |
| 8.617983752086561e-14 | 22250 |
| 8.483737993889048e-14 | 22260 |
| 8.3515834352241e-14 | 22270 |
| 8.221487500645494e-14 | 22280 |
| 8.093418122147498e-14 | 22290 |
| 7.967343731260638e-14 | 22300 |
| 7.84323325127002e-14 | 22310 |
| 7.72105608955493e-14 | 22320 |
| 7.600782130048234e-14 | 22330 |
| 7.48238172581274e-14 | 22340 |
| 7.365825691733219e-14 | 22350 |
| 7.2510852973228e-14 | 22360 |
| 7.138132259640609e-14 | 22370 |
| 7.026938736320544e-14 | 22380 |
| 6.917477318708099e-14 | 22390 |
| 6.80972102510413e-14 | 22400 |
| 6.70364329411429e-14 | 22410 |
| 6.599217978101627e-14 | 22420 |
| 6.496419336741178e-14 | 22430 |
| 6.3952220306754e-14 | 22440 |
| 6.295601115267987e-14 | 22450 |
| 6.197532034455015e-14 | 22460 |
| 6.10099061469226e-14 | 22470 |
| 6.005953058996405e-14 | 22480 |
| 5.912395941079069e-14 | 22490 |
| 5.820296199572607e-14 | 22500 |
| 5.729631132345461e-14 | 22510 |
| 5.6403783909060776e-14 | 22520 |
| 5.5525159748943595e-14 | 22530 |
| 5.4660222266585624e-14 | 22540 |
| 5.380875825916675e-14 | 22550 |
| 5.297055784501345e-14 | 22560 |
| 5.214541441186097e-14 | 22570 |
| 5.1333124565926996e-14 | 22580 |
| 5.053348808177505e-14 | 22590 |
| 4.9746307852958724e-14 | 22600 |
| 4.897138984343817e-14 | 22610 |
| 4.8208543039750046e-14 | 22620 |
| 4.745757940392261e-14 | 22630 |
| 4.671831382712737e-14 | 22640 |
| 4.5990564084049615e-14 | 22650 |
| 4.5274150787969805e-14 | 22660 |
| 4.4568897346547614e-14 | 22670 |
| 4.387462991829178e-14 | 22680 |
| 4.319117736970809e-14 | 22690 |
| 4.2518371233117745e-14 | 22700 |
| 4.185604566512991e-14 | 22710 |
| 4.120403740576128e-14 | 22720 |
| 4.0562185738195087e-14 | 22730 |
| 3.993033244916428e-14 | 22740 |
| 3.9308321789951917e-14 | 22750 |
| 3.8696000438001824e-14 | 22760 |
| 3.8093217459123137e-14 | 22770 |
| 3.749982427028769e-14 | 22780 |
| 3.691567460300418e-14 | 22790 |
| 3.634062446726297e-14 | 22800 |
| 3.577453211604478e-14 | 22810 |
| 3.521725801038001e-14 | 22820 |
| 3.466866478495228e-14 | 22830 |
| 3.4128617214240105e-14 | 22840 |
| 3.3596982179183675e-14 | 22850 |
| 3.307362863437096e-14 | 22860 |
| 3.255842757573714e-14 | 22870 |
| 3.2051252008764934e-14 | 22880 |
| 3.15519769171805e-14 | 22890 |
| 3.106047923213882e-14 | 22900 |
| 3.057663780188721e-14 | 22910 |
| 3.0100333361901315e-14 | 22920 |
| 2.9631448505488355e-14 | 22930 |
| 2.916986765484624e-14 | 22940 |
| 2.8715477032573616e-14 | 22950 |
| 2.8268164633625772e-14 | 22960 |
| 2.7827820197704274e-14 | 22970 |
| 2.7394335182079774e-14 | 22980 |
| 2.6967602734836177e-14 | 22990 |
| 2.654751766853156e-14 | 23000 |
| 2.6133976434271164e-14 | 23010 |
| 2.572687709618252e-14 | 23020 |
| 2.5326119306288218e-14 | 23030 |
| 2.49316042797717e-14 | 23040 |
| 2.4543234770626774e-14 | 23050 |
| 2.41609150476864e-14 | 23060 |
| 2.378455087102651e-14 | 23070 |
| 2.3414049468735774e-14 | 23080 |
| 2.3049319514047306e-14 | 23090 |
| 2.269027110282805e-14 | 23100 |
| 2.2336815731417375e-14 | 23110 |
| 2.1988866274810862e-14 | 23120 |
| 2.1646336965185395e-14 | 23130 |
| 2.1309143370757314e-14 | 23140 |
| 2.0977202374969962e-14 | 23150 |
| 2.0650432156006922e-14 | 23160 |
| 2.0328752166622135e-14 | 23170 |
| 2.001208311428646e-14 | 23180 |
| 1.970034694164197e-14 | 23190 |
| 1.9393466807260834e-14 | 23200 |
| 1.9091367066705082e-14 | 23210 |
| 1.879397325388022e-14 | 23220 |
| 1.8501212062679315e-14 | 23230 |
| 1.8213011328914178e-14 | 23240 |
| 1.7929300012526873e-14 | 23250 |
| 1.7650008180078294e-14 | 23260 |
| 1.7375066987510687e-14 | 23270 |
| 1.7104408663177556e-14 | 23280 |
| 1.6837966491137903e-14 | 23290 |
| 1.6575674794711826e-14 | 23300 |
| 1.6317468920291173e-14 | 23310 |
| 1.6063285221402385e-14 | 23320 |
| 1.581306104301867e-14 | 23330 |
| 1.5566734706115484e-14 | 23340 |
| 1.5324245492466638e-14 | 23350 |
| 1.5085533629678315e-14 | 23360 |
| 1.4850540276454605e-14 | 23370 |
| 1.461920750809418e-14 | 23380 |
| 1.439147830221179e-14 | 23390 |
| 1.416729652468225e-14 | 23400 |
| 1.3946606915804245e-14 | 23410 |
| 1.3729355076678802e-14 | 23420 |
| 1.351548745579992e-14 | 23430 |
| 1.3304951335854982e-14 | 23440 |
| 1.3097694820729896e-14 | 23450 |
| 1.2893666822716692e-14 | 23460 |
| 1.2692817049921213e-14 | 23470 |
| 1.2495095993866116e-14 | 23480 |
| 1.2300454917287023e-14 | 23490 |
| 1.2108845842119558e-14 | 23500 |
| 1.1920221537672729e-14 | 23510 |
| 1.1734535508986522e-14 | 23520 |
| 1.1551741985371657e-14 | 23530 |
| 1.1371795909127072e-14 | 23540 |
| 1.1194652924433174e-14 | 23550 |
| 1.1020269366418922e-14 | 23560 |
| 1.0848602250398015e-14 | 23570 |
| 1.0679609261273926e-14 | 23580 |
| 1.0513248743109207e-14 | 23590 |
| 1.0349479688857272e-14 | 23600 |
| 1.0188261730254831e-14 | 23610 |
| 1.0029555127871065e-14 | 23620 |
| 9.873320761311855e-15 | 23630 |
| 9.719520119577222e-15 | 23640 |
| 9.568115291568335e-15 | 23650 |
| 9.419068956742417e-15 | 23660 |
| 9.272344375913822e-15 | 23670 |
| 9.127905382197796e-15 | 23680 |
| 8.985716372095332e-15 | 23690 |
| 8.845742296717472e-15 | 23700 |
| 8.707948653145725e-15 | 23710 |
| 8.572301475927096e-15 | 23720 |
| 8.438767328702189e-15 | 23730 |
| 8.307313295962833e-15 | 23740 |
| 8.177906974938985e-15 | 23750 |
| 8.050516467611431e-15 | 23760 |
| 7.925110372848907e-15 | 23770 |
| 7.801657778668222e-15 | 23780 |
| 7.680128254614432e-15 | 23790 |
| 7.560491844259722e-15 | 23800 |
| 7.442719057819619e-15 | 23810 |
| 7.326780864883746e-15 | 23820 |
| 7.21264868725981e-15 | 23830 |
| 7.1002943919295286e-15 | 23840 |
| 6.989690284113832e-15 | 23850 |
| 6.880809100446079e-15 | 23860 |
| 6.773624002252075e-15 | 23870 |
| 6.668108568934318e-15 | 23880 |
| 6.5642367914593155e-15 | 23890 |
| 6.461983065946767e-15 | 23900 |
| 6.361322187358188e-15 | 23910 |
| 6.262229343283865e-15 | 23920 |
| 6.164680107827029e-15 | 23930 |
| 6.068650435582637e-15 | 23940 |
| 5.974116655710609e-15 | 23950 |
| 5.881055466100948e-15 | 23960 |
| 5.78944392762976e-15 | 23970 |
| 5.699259458505127e-15 | 23980 |
| 5.6104798287006755e-15 | 23990 |
| 5.523083154475869e-15 | 24000 |
| 5.437047892982019e-15 | 24010 |
| 5.352352836951945e-15 | 24020 |
| 5.2689771094723866e-15 | 24030 |
| 5.1869001588381735e-15 | 24040 |
| 5.10610175348621e-15 | 24050 |
| 5.0265619770083955e-15 | 24060 |
| 4.948261223242539e-15 | 24070 |
| 4.871180191439431e-15 | 24080 |
| 4.7952998815052e-15 | 24090 |
| 4.720601589318092e-15 | 24100 |
| 4.64706690211789e-15 | 24110 |
| 4.5746776939671626e-15 | 24120 |
| 4.50341612128354e-15 | 24130 |
| 4.433264618441098e-15 | 24140 |
| 4.364205893440748e-15 | 24150 |
| 4.296222923647738e-15 | 24160 |
| 4.2292989515955766e-15 | 24170 |
| 4.163417480855575e-15 | 24180 |
| 4.098562271970473e-15 | 24190 |
| 4.034717338451402e-15 | 24200 |
| 3.971866942837473e-15 | 24210 |
| 3.909995592816476e-15 | 24220 |
| 3.849088037406023e-15 | 24230 |
| 3.789129263194429e-15 | 24240 |
| 3.730104490639882e-15 | 24250 |
| 3.67199917042729e-15 | 24260 |
| 3.614798979882106e-15 | 24270 |
| 3.558489819439775e-15 | 24280 |
| 3.503057809170184e-15 | 24290 |
| 3.4484892853564893e-15 | 24300 |
| 3.39477079712699e-15 | 24310 |
| 3.3418891031394902e-15 | 24320 |
| 3.289831168317538e-15 | 24330 |
| 3.238584160637154e-15 | 24340 |
| 3.1881354479639695e-15 | 24350 |
| 3.1384725949393885e-15 | 24360 |
| 3.0895833599152746e-15 | 24370 |
| 3.0414556919365757e-15 | 24380 |
| 2.9940777277707544e-15 | 24390 |
| 2.9474377889835e-15 | 24400 |
| 2.9015243790601762e-15 | 24410 |
| 2.8563261805719256e-15 | 24420 |
| 2.8118320523859163e-15 | 24430 |
| 2.7680310269192315e-15 | 24440 |
| 2.724912307435353e-15 | 24450 |
| 2.682465265382758e-15 | 24460 |
| 2.6406794377751565e-15 | 24470 |
| 2.599544524612351e-15 | 24480 |
| 2.5590503863412868e-15 | 24490 |
| 2.519187041356812e-15 | 24500 |
| 2.4799446635412047e-15 | 24510 |
| 2.441313579842032e-15 | 24520 |
| 2.4032842678879128e-15 | 24530 |
| 2.3658473536411603e-15 | 24540 |
| 2.3289936090872514e-15 | 24550 |
| 2.2927139499601103e-15 | 24560 |
| 2.256999433502837e-15 | 24570 |
| 2.221841256263458e-15 | 24580 |
| 2.187230751924871e-15 | 24590 |
| 2.15315938916859e-15 | 24600 |
| 2.1196187695719185e-15 | 24610 |
| 2.086600625537725e-15 | 24620 |
| 2.0540968182564807e-15 | 24630 |
| 2.022099335700172e-15 | 24640 |
| 1.9906002906473298e-15 | 24650 |
| 1.9595919187388264e-15 | 24660 |
| 1.929066576564084e-15 | 24670 |
| 1.8990167397769685e-15 | 24680 |
| 1.8694350012410375e-15 | 24690 |
| 1.840314069203795e-15 | 24700 |
| 1.8116467654992728e-15 | 24710 |
| 1.7834260237786076e-15 | 24720 |
| 1.7556448877683129e-15 | 24730 |
| 1.7282965095554879e-15 | 24740 |
| 1.7013741478999303e-15 | 24750 |
| 1.6748711665724159e-15 | 24760 |
| 1.6487810327188649e-15 | 24770 |
| 1.623097315250097e-15 | 24780 |
| 1.5978136832565645e-15 | 24790 |
| 1.5729239044477794e-15 | 24800 |
| 1.5484218436161539e-15 | 24810 |
| 1.5243014611246668e-15 | 24820 |
| 1.500556811418091e-15 | 24830 |
| 1.4771820415575083e-15 | 24840 |
| 1.454171389777556e-15 | 24850 |
| 1.43151918406615e-15 | 24860 |
| 1.4092198407664234e-15 | 24870 |
| 1.3872678632003507e-15 | 24880 |
| 1.365657840313816e-15 | 24890 |
| 1.3443844453428823e-15 | 24900 |
| 1.323442434500694e-15 | 24910 |
| 1.302826645684976e-15 | 24920 |
| 1.2825319972055705e-15 | 24930 |
| 1.262553486531801e-15 | 24940 |
| 1.2428861890594266e-15 | 24950 |
| 1.2235252568967236e-15 | 24960 |
| 1.204465917669478e-15 | 24970 |
| 1.1857034733446725e-15 | 24980 |
| 1.1672332990724166e-15 | 24990 |
| 1.1490508420459197e-15 | 25000 |
| 2.478874664691467 | 25010 |
| 2.474982389972422 | 25020 |
| 2.471096762568323 | 25030 |
| 2.4672177702120393 | 25040 |
| 2.463345400660741 | 25050 |
| 2.4594796416958786 | 25060 |
| 2.4556204811231255 | 25070 |
| 2.4517679067723246 | 25080 |
| 2.4479219064974482 | 25090 |
| 2.4440824681765165 | 25100 |
| 2.4402495797115873 | 25110 |
| 2.436423229028679 | 25120 |
| 2.4326034040777262 | 25130 |
| 2.42879009283253 | 25140 |
| 2.424983283290705 | 25150 |
| 2.421182963473632 | 25160 |
| 2.417389121426406 | 25170 |
| 2.4136017452177843 | 25180 |
| 2.409820822940141 | 25190 |
| 2.4060463427094128 | 25200 |
| 2.4022782926650565 | 25210 |
| 2.3985166609699755 | 25220 |
| 2.394761435810501 | 25230 |
| 2.39101260539634 | 25240 |
| 2.387270157960498 | 25250 |
| 2.383534081759253 | 25260 |
| 2.379804365072102 | 25270 |
| 2.376080996201713 | 25280 |
| 2.3723639634738523 | 25290 |
| 2.3686532552373905 | 25300 |
| 2.3649488598641972 | 25310 |
| 2.3612507657491215 | 25320 |
| 2.3575589613099357 | 25330 |
| 2.353873434987289 | 25340 |
| 2.350194175244664 | 25350 |
| 2.3465211705683044 | 25360 |
| 2.342854409467206 | 25370 |
| 2.3391938804730374 | 25380 |
| 2.3355395721401075 | 25390 |
| 2.3318914730453106 | 25400 |
| 2.3282495717880813 | 25410 |
| 2.324613856990347 | 25420 |
| 2.320984317296481 | 25430 |
| 2.317360941373253 | 25440 |
| 2.313743717909784 | 25450 |
| 2.310132635617505 | 25460 |
| 2.3065276832300836 | 25470 |
| 2.3029288495034175 | 25480 |
| 2.2993361232155536 | 25490 |
| 2.2957494931666713 | 25500 |
| 2.292168948179004 | 25510 |
| 2.288594477096812 | 25520 |
| 2.2850260687863386 | 25530 |
| 2.2814637121357406 | 25540 |
| 2.277907396055068 | 25550 |
| 2.2743571094762225 | 25560 |
| 2.2708128413528796 | 25570 |
| 2.2672745806604664 | 25580 |
| 2.26374231639611 | 25590 |
| 2.2602160375785982 | 25600 |
| 2.256695733248311 | 25610 |
| 2.2531813924672073 | 25620 |
| 2.24967300431876 | 25630 |
| 2.2461705579079143 | 25640 |
| 2.2426740423610436 | 25650 |
| 2.2391834468259026 | 25660 |
| 2.2356987604715854 | 25670 |
| 2.232219972488478 | 25680 |
| 2.228747072088214 | 25690 |
| 2.22528004850363 | 25700 |
| 2.221818890988724 | 25710 |
| 2.218363588818611 | 25720 |
| 2.21491413128946 | 25730 |
| 2.211470507718483 | 25740 |
| 2.208032707443863 | 25750 |
| 2.204600719824735 | 25760 |
| 2.2011745342411126 | 25770 |
| 2.197754140093865 | 25780 |
| 2.194339526804671 | 25790 |
| 2.1909306838159552 | 25800 |
| 2.187527600590874 | 25810 |
| 2.1841302666132676 | 25820 |
| 2.180738671387593 | 25830 |
| 2.1773528044389 | 25840 |
| 2.1739726553127845 | 25850 |
| 2.1705982135753485 | 25860 |
| 2.1672294688131406 | 25870 |
| 2.1638664106331373 | 25880 |
| 2.1605090286626853 | 25890 |
| 2.1571573125494634 | 25900 |
| 2.1538112519614367 | 25910 |
| 2.150470836586816 | 25920 |
| 2.1471360561340167 | 25930 |
| 2.143806900331614 | 25940 |
| 2.140483358928301 | 25950 |
| 2.1371654216928495 | 25960 |
| 2.1338530784140644 | 25970 |
| 2.1305463189007474 | 25980 |
| 2.127245132981638 | 25990 |
| 2.123949510505397 | 26000 |
| 2.120659441340545 | 26010 |
| 2.117374915375441 | 26020 |
| 2.1140959225182154 | 26030 |
| 2.1108224526967443 | 26040 |
| 2.1075544958586123 | 26050 |
| 2.1042920419710462 | 26060 |
| 2.101035081020905 | 26070 |
| 2.097783603014635 | 26080 |
| 2.0945375979782033 | 26090 |
| 2.09129705595708 | 26100 |
| 2.08806196701619 | 26110 |
| 2.0848323212398787 | 26120 |
| 2.08160810873185 | 26130 |
| 2.0783893196151566 | 26140 |
| 2.075175944032141 | 26150 |
| 2.0719679721443978 | 26160 |
| 2.068765394132735 | 26170 |
| 2.065568200197132 | 26180 |
| 2.062376380556704 | 26190 |
| 2.0591899254496564 | 26200 |
| 2.0560088251332482 | 26210 |
| 2.052833069883753 | 26220 |
| 2.049662649996416 | 26230 |
| 2.0464975557854226 | 26240 |
| 2.0433377775838375 | 26250 |
| 2.0401833057435947 | 26260 |
| 2.037034130635435 | 26270 |
| 2.0338902426488907 | 26280 |
| 2.030751632192216 | 26290 |
| 2.027618289692367 | 26300 |
| 2.0244902055949665 | 26310 |
| 2.0213673703642416 | 26320 |
| 2.0182497744830155 | 26330 |
| 2.015137408452645 | 26340 |
| 2.0120302627930067 | 26350 |
| 2.0089283280424257 | 26360 |
| 2.0058315947576673 | 26370 |
| 2.002740053513868 | 26380 |
| 1.9996536949045314 | 26390 |
| 1.996572509541468 | 26400 |
| 1.9934964880547623 | 26410 |
| 1.9904256210927356 | 26420 |
| 1.987359899321907 | 26430 |
| 1.984299313426956 | 26440 |
| 1.9812438541106847 | 26450 |
| 1.97819351209398 | 26460 |
| 1.9751482781157763 | 26470 |
| 1.9721081429330176 | 26480 |
| 1.9690730973206254 | 26490 |
| 1.9660431320714402 | 26500 |
| 1.9630182379962167 | 26510 |
| 1.9599984059235633 | 26520 |
| 1.9569836266999083 | 26530 |
| 1.9539738911894797 | 26540 |
| 1.9509691902742408 | 26550 |
| 1.9479695148538771 | 26560 |
| 1.9449748558457347 | 26570 |
| 1.9419852041848136 | 26580 |
| 1.9390005508237114 | 26590 |
| 1.9360208867325857 | 26600 |
| 1.933046202899139 | 26610 |
| 1.9300764903285514 | 26620 |
| 1.9271117400434692 | 26630 |
| 1.9241519430839455 | 26640 |
| 1.9211970905074307 | 26650 |
| 1.9182471733887192 | 26660 |
| 1.9153021828199184 | 26670 |
| 1.9123621099104096 | 26680 |
| 1.9094269457868172 | 26690 |
| 1.906496681592968 | 26700 |
| 1.9035713084898593 | 26710 |
| 1.9006508176556212 | 26720 |
| 1.897735200285481 | 26730 |
| 1.89482444759173 | 26740 |
| 1.8919185508036898 | 26750 |
| 1.8890175011676604 | 26760 |
| 1.886121289946912 | 26770 |
| 1.8832299084216324 | 26780 |
| 1.8803433478888902 | 26790 |
| 1.8774615996626205 | 26800 |
| 1.8745846550735596 | 26810 |
| 1.871712505469236 | 26820 |
| 1.8688451422139107 | 26830 |
| 1.865982556688571 | 26840 |
| 1.863124740290878 | 26850 |
| 1.8602716844351301 | 26860 |
| 1.8574233805522498 | 26870 |
| 1.8545798200897183 | 26880 |
| 1.8517409945115688 | 26890 |
| 1.8489068952983243 | 26900 |
| 1.8460775139469945 | 26910 |
| 1.8432528419710226 | 26920 |
| 1.8404328709002549 | 26930 |
| 1.8376175922809073 | 26940 |
| 1.834806997675533 | 26950 |
| 1.8320010786629866 | 26960 |
| 1.829199826838391 | 26970 |
| 1.8264032338131055 | 26980 |
| 1.8236112912146887 | 26990 |
| 1.8208239906868695 | 27000 |
| 1.8180413238895146 | 27010 |
| 1.8152632824985784 | 27020 |
| 1.8124898582060975 | 27030 |
| 1.8097210427201391 | 27040 |
| 1.8069568277647665 | 27050 |
| 1.8041972050800266 | 27060 |
| 1.8014421664218878 | 27070 |
| 1.7986917035622305 | 27080 |
| 1.7959458082887927 | 27090 |
| 1.7932044724051617 | 27100 |
| 1.7904676877307268 | 27110 |
| 1.7877354461006432 | 27120 |
| 1.785007739365821 | 27130 |
| 1.7822845593928627 | 27140 |
| 1.779565898064055 | 27150 |
| 1.7768517472773138 | 27160 |
| 1.7741420989461791 | 27170 |
| 1.7714369449997638 | 27180 |
| 1.7687362773827267 | 27190 |
| 1.7660400880552416 | 27200 |
| 1.763348368992964 | 27210 |
| 1.7606611121869993 | 27220 |
| 1.7579783096438708 | 27230 |
| 1.7552999533854898 | 27240 |
| 1.7526260354491214 | 27250 |
| 1.7499565478873584 | 27260 |
| 1.7472914827680737 | 27270 |
| 1.744630832174412 | 27280 |
| 1.741974588204743 | 27290 |
| 1.7393227429726348 | 27300 |
| 1.736675288606817 | 27310 |
| 1.7340322172511675 | 27320 |
| 1.7313935210646587 | 27330 |
| 1.7287591922213297 | 27340 |
| 1.7261292229102718 | 27350 |
| 1.7235036053355846 | 27360 |
| 1.7208823317163477 | 27370 |
| 1.7182653942865869 | 27380 |
| 1.7156527852952577 | 27390 |
| 1.7130444970061962 | 27400 |
| 1.7104405216980874 | 27410 |
| 1.7078408516644565 | 27420 |
| 1.70524547921362 | 27430 |
| 1.702654396668662 | 27440 |
| 1.7000675963674017 | 27450 |
| 1.6974850706623632 | 27460 |
| 1.694906811920747 | 27470 |
| 1.6923328125243995 | 27480 |
| 1.689763064869781 | 27490 |
| 1.6871975613679375 | 27500 |
| 1.6846362944444715 | 27510 |
| 1.6820792565395135 | 27520 |
| 1.6795264401076786 | 27530 |
| 1.67697783761806 | 27540 |
| 1.6744334415541824 | 27550 |
| 1.6718932444139785 | 27560 |
| 1.669357238709753 | 27570 |
| 1.6668254169681718 | 27580 |
| 1.6642977717302094 | 27590 |
| 1.6617742955511232 | 27600 |
| 1.6592549810004409 | 27610 |
| 1.6567398206619177 | 27620 |
| 1.6542288071335098 | 27630 |
| 1.6517219330273418 | 27640 |
| 1.6492191909696936 | 27650 |
| 1.6467205736009518 | 27660 |
| 1.6442260735755794 | 27670 |
| 1.6417356835621097 | 27680 |
| 1.6392493962430985 | 27690 |
| 1.6367672043151016 | 27700 |
| 1.634289100488645 | 27710 |
| 1.6318150774881965 | 27720 |
| 1.6293451280521378 | 27730 |
| 1.6268792449327347 | 27740 |
| 1.6244174208961113 | 27750 |
| 1.6219596487222185 | 27760 |
| 1.6195059212048075 | 27770 |
| 1.6170562311514052 | 27780 |
| 1.6146105713832712 | 27790 |
| 1.612168934735391 | 27800 |
| 1.609731314056435 | 27810 |
| 1.607297702208733 | 27820 |
| 1.6048680920682417 | 27830 |
| 1.6024424765245344 | 27840 |
| 1.600020848480752 | 27850 |
| 1.597603200853576 | 27860 |
| 1.5951895265732214 | 27870 |
| 1.5927798185833906 | 27880 |
| 1.5903740698412525 | 27890 |
| 1.5879722733174104 | 27900 |
| 1.5855744219958896 | 27910 |
| 1.583180508874091 | 27920 |
| 1.5807905269627631 | 27930 |
| 1.5784044692859962 | 27940 |
| 1.5760223288811772 | 27950 |
| 1.573644098798968 | 27960 |
| 1.5712697721032773 | 27970 |
| 1.5688993418712347 | 27980 |
| 1.5665328011931632 | 27990 |
| 1.5641701431725517 | 28000 |
| 1.56181136092603 | 28010 |
| 1.55945644758334 | 28020 |
| 1.5571053962873138 | 28030 |
| 1.5547582001938314 | 28040 |
| 1.5524148524718182 | 28050 |
| 1.5500753463032009 | 28060 |
| 1.5477396748828873 | 28070 |
| 1.545407831418738 | 28080 |
| 1.5430798091315376 | 28090 |
| 1.5407556012549861 | 28100 |
| 1.5384352010356355 | 28110 |
| 1.5361186017329016 | 28120 |
| 1.5338057966190186 | 28130 |
| 1.531496778979017 | 28140 |
| 1.5291915421106976 | 28150 |
| 1.5268900793246012 | 28160 |
| 1.5245923839440019 | 28170 |
| 1.5222984493048437 | 28180 |
| 1.520008268755753 | 28190 |
| 1.517721835657992 | 28200 |
| 1.51543914338544 | 28210 |
| 1.5131601853245629 | 28220 |
| 1.5108849548743943 | 28230 |
| 1.5086134454465032 | 28240 |
| 1.5063456504649728 | 28250 |
| 1.5040815633663738 | 28260 |
| 1.5018211775997388 | 28270 |
| 1.4995644866265383 | 28280 |
| 1.4973114839206565 | 28290 |
| 1.4950621629683545 | 28300 |
| 1.4928165172682648 | 28310 |
| 1.4905745403313533 | 28320 |
| 1.4883362256808956 | 28330 |
| 1.4861015668524558 | 28340 |
| 1.4838705573938538 | 28350 |
| 1.4816431908651608 | 28360 |
| 1.4794194608386388 | 28370 |
| 1.47719936089875 | 28380 |
| 1.4749828846421154 | 28390 |
| 1.472770025677494 | 28400 |
| 1.4705607776257579 | 28410 |
| 1.4683551341198624 | 28420 |
| 1.4661530888048422 | 28430 |
| 1.4639546353377506 | 28440 |
| 1.4617597673876683 | 28450 |
| 1.4595684786356646 | 28460 |
| 1.4573807627747748 | 28470 |
| 1.4551966135099763 | 28480 |
| 1.4530160245581638 | 28490 |
| 1.4508389896481275 | 28500 |
| 1.4486655025205257 | 28510 |
| 1.4464955569278632 | 28520 |
| 1.444329146634467 | 28530 |
| 1.4421662654164602 | 28540 |
| 1.4400069070617458 | 28550 |
| 1.437851065369965 | 28560 |
| 1.4356987341524954 | 28570 |
| 1.4335499072324156 | 28580 |
| 1.4314045784444815 | 28590 |
| 1.4292627416351051 | 28600 |
| 1.4271243906623268 | 28610 |
| 1.424989519395809 | 28620 |
| 1.4228581217167786 | 28630 |
| 1.4207301915180373 | 28640 |
| 1.4186057227039213 | 28650 |
| 1.4164847091902824 | 28660 |
| 1.4143671449044628 | 28670 |
| 1.4122530237852708 | 28680 |
| 1.4101423397829729 | 28690 |
| 1.4080350868592366 | 28700 |
| 1.4059312589871433 | 28710 |
| 1.4038308501511456 | 28720 |
| 1.4017338543470501 | 28730 |
| 1.3996402655819933 | 28740 |
| 1.3975500778744183 | 28750 |
| 1.3954632852540536 | 28760 |
| 1.3933798817618885 | 28770 |
| 1.3912998614501522 | 28780 |
| 1.3892232183822888 | 28790 |
| 1.38714994663294 | 28800 |
| 1.3850800402879095 | 28810 |
| 1.3830134934441582 | 28820 |
| 1.3809503002097705 | 28830 |
| 1.3788904547039342 | 28840 |
| 1.3768339510569187 | 28850 |
| 1.3747807834100518 | 28860 |
| 1.3727309459156984 | 28870 |
| 1.3706844327372378 | 28880 |
| 1.3686412380490414 | 28890 |
| 1.3666013560364507 | 28900 |
| 1.3645647808957555 | 28910 |
| 1.362531506834171 | 28920 |
| 1.3605015280698172 | 28930 |
| 1.3584748388316954 | 28940 |
| 1.3564514333596678 | 28950 |
| 1.3544313059044337 | 28960 |
| 1.3524144507275102 | 28970 |
| 1.3504008621012085 | 28980 |
| 1.3483905343086122 | 28990 |
| 1.3463834616435575 | 29000 |
| 1.3443796384106095 | 29010 |
| 1.342379058925041 | 29020 |
| 1.340381717512813 | 29030 |
| 1.33838760851055 | 29040 |
| 1.3363967262655205 | 29050 |
| 1.3344090651356193 | 29060 |
| 1.3324246194893317 | 29070 |
| 1.3304433837057328 | 29080 |
| 1.3284653521744527 | 29090 |
| 1.3264905192956582 | 29100 |
| 1.3245188794800329 | 29110 |
| 1.3225504271487554 | 29120 |
| 1.3205851567334768 | 29130 |
| 1.3186230626763018 | 29140 |
| 1.3166641394297682 | 29150 |
| 1.314708381456823 | 29160 |
| 1.312755783230803 | 29170 |
| 1.3108063392354155 | 29180 |
| 1.3088600439647153 | 29190 |
| 1.306916891923085 | 29200 |
| 1.3049768776252137 | 29210 |
| 1.3030399955960776 | 29220 |
| 1.3011062403709175 | 29230 |
| 1.2991756064952191 | 29240 |
| 1.2972480885246935 | 29250 |
| 1.2953236810252553 | 29260 |
| 1.2934023785730024 | 29270 |
| 1.2914841757541955 | 29280 |
| 1.289569067165239 | 29290 |
| 1.2876570474126585 | 29300 |
| 1.285748111113083 | 29310 |
| 1.2838422528932256 | 29320 |
| 1.2819394673898519 | 29330 |
| 1.2800397492497786 | 29340 |
| 1.2781430931298408 | 29350 |
| 1.2762494936968745 | 29360 |
| 1.2743589456276976 | 29370 |
| 1.272471443609089 | 29380 |
| 1.2705869823377696 | 29390 |
| 1.2687055565203815 | 29400 |
| 1.2668271608734678 | 29410 |
| 1.264951790123455 | 29420 |
| 1.2630794390066309 | 29430 |
| 1.2612101022691253 | 29440 |
| 1.2593437746668916 | 29450 |
| 1.2574804509656863 | 29460 |
| 1.2556201259410482 | 29470 |
| 1.2537627943782816 | 29480 |
| 1.251908451072434 | 29490 |
| 1.2500570908282789 | 29500 |
| 1.2482087084602946 | 29510 |
| 1.2463632987926458 | 29520 |
| 1.2445208566591641 | 29530 |
| 1.242681376903328 | 29540 |
| 1.2408448543782453 | 29550 |
| 1.2390112839466316 | 29560 |
| 1.2371806604807931 | 29570 |
| 1.2353529788626096 | 29580 |
| 1.2335282339835034 | 29590 |
| 1.2317064207444384 | 29600 |
| 1.2298875340558884 | 29610 |
| 1.2280715688378223 | 29620 |
| 1.2262585200196847 | 29630 |
| 1.2244483825403765 | 29640 |
| 1.2226411513482358 | 29650 |
| 1.2208368214010212 | 29660 |
| 1.2190353876658906 | 29670 |
| 1.2172368451193831 | 29680 |
| 1.215441188747401 | 29690 |
| 1.2136484135451906 | 29700 |
| 1.2118585145173242 | 29710 |
| 1.2100714866776796 | 29720 |
| 1.208287325049424 | 29730 |
| 1.2065060246649952 | 29740 |
| 1.2047275805660809 | 29750 |
| 1.202951987803602 | 29760 |
| 1.2011792414376947 | 29770 |
| 1.1994093365376914 | 29780 |
| 1.1976422681821015 | 29790 |
| 1.195878031458595 | 29800 |
| 1.1941166214639833 | 29810 |
| 1.1923580333042 | 29820 |
| 1.190602262094288 | 29830 |
| 1.1888493029583678 | 29840 |
| 1.1870991510296374 | 29850 |
| 1.185351801450343 | 29860 |
| 1.1836072493717638 | 29870 |
| 1.1818654899541934 | 29880 |
| 1.1801265183669225 | 29890 |
| 1.1783903297882217 | 29900 |
| 1.1766569194053216 | 29910 |
| 1.1749262824143971 | 29920 |
| 1.1731984140205487 | 29930 |
| 1.171473309437784 | 29940 |
| 1.169750963889002 | 29950 |
| 1.1680313726059732 | 29960 |
| 1.166314530829324 | 29970 |
| 1.1646004338085174 | 29980 |
| 1.1628890768018365 | 29990 |
| 1.1611804550763667 | 30000 |
| 1.1594745639079787 | 30010 |
| 1.1577713985813094 | 30020 |
| 1.156070954389747 | 30030 |
| 1.1543732266354114 | 30040 |
| 1.1526782106291382 | 30050 |
| 1.150985901690461 | 30060 |
| 1.1492962951475942 | 30070 |
| 1.1476093863374157 | 30080 |
| 1.1459251706054523 | 30090 |
| 1.1442436433058516 | 30100 |
| 1.1425647998013828 | 30110 |
| 1.1408886354634058 | 30120 |
| 1.139215145671859 | 30130 |
| 1.137544325815243 | 30140 |
| 1.1358761712906 | 30150 |
| 1.134210677503502 | 30160 |
| 1.1325478398680293 | 30170 |
| 1.1308876538067563 | 30180 |
| 1.1292301147507335 | 30190 |
| 1.1275752181394725 | 30200 |
| 1.1259229594209261 | 30210 |
| 1.1242733340514741 | 30220 |
| 1.1226263374959067 | 30230 |
| 1.1209819652274056 | 30240 |
| 1.11934021272753 | 30250 |
| 1.1177010754861987 | 30260 |
| 1.116064549001673 | 30270 |
| 1.1144306287805417 | 30280 |
| 1.1127993103377039 | 30290 |
| 1.111170589196352 | 30300 |
| 1.1095444608879559 | 30310 |
| 1.1079209209522474 | 30320 |
| 1.1062999649372016 | 30330 |
| 1.1046815883990233 | 30340 |
| 1.1030657869021314 | 30350 |
| 1.1014525560191335 | 30360 |
| 1.0998418913308237 | 30370 |
| 1.0982337884261584 | 30380 |
| 1.0966282429022405 | 30390 |
| 1.0950252503643045 | 30400 |
| 1.0934248064257006 | 30410 |
| 1.0918269067078774 | 30420 |
| 1.090231546840368 | 30430 |
| 1.088638722460772 | 30440 |
| 1.0870484292147407 | 30450 |
| 1.0854606627559604 | 30460 |
| 1.083875418746138 | 30470 |
| 1.0822926928549834 | 30480 |
| 1.0807124807601949 | 30490 |
| 1.0791347781474434 | 30500 |
| 1.0775595807103555 | 30510 |
| 1.0759868841504996 | 30520 |
| 1.0744166841773688 | 30530 |
| 1.0728489765083657 | 30540 |
| 1.0712837568687872 | 30550 |
| 1.0697210209918087 | 30560 |
| 1.0681607646184683 | 30570 |
| 1.0666029834976514 | 30580 |
| 1.0650476733860752 | 30590 |
| 1.063494830048277 | 30600 |
| 1.0619444492565866 | 30610 |
| 1.060396526791127 | 30620 |
| 1.0588510584397903 | 30630 |
| 1.057308039998222 | 30640 |
| 1.0557674672698092 | 30650 |
| 1.0542293360656625 | 30660 |
| 1.0526936422046023 | 30670 |
| 1.0511603815131434 | 30680 |
| 1.049629549825479 | 30690 |
| 1.048101142983467 | 30700 |
| 1.0465751568366142 | 30710 |
| 1.0450515872420607 | 30720 |
| 1.0435304300645663 | 30730 |
| 1.0420116811764935 | 30740 |
| 1.0404953364577945 | 30750 |
| 1.038981391795996 | 30760 |
| 1.0374698430861828 | 30770 |
| 1.0359606862309843 | 30780 |
| 1.0344539171405593 | 30790 |
| 1.0329495317325814 | 30800 |
| 1.031447525932224 | 30810 |
| 1.0299478956721455 | 30820 |
| 1.0284506368924746 | 30830 |
| 1.0269557455407963 | 30840 |
| 1.0254632175721365 | 30850 |
| 1.023973048948949 | 30860 |
| 1.0224852356410943 | 30870 |
| 1.0209997736258354 | 30880 |
| 1.0195166588878173 | 30890 |
| 1.0180358874190523 | 30900 |
| 1.0165574552189076 | 30910 |
| 1.0150813582940885 | 30920 |
| 1.0136075926586268 | 30930 |
| 1.0121361543338645 | 30940 |
| 1.0106670393484392 | 30950 |
| 1.0092002437382717 | 30960 |
| 1.0077357635465498 | 30970 |
| 1.0062735948237154 | 30980 |
| 1.0048137336274492 | 30990 |
| 1.003356176022657 | 31000 |
| 1.0019009180814562 | 31010 |
| 1.0004479558831607 | 31020 |
| 0.9989972855142667 | 31030 |
| 0.9975489030684391 | 31040 |
| 0.9961028046464985 | 31050 |
| 0.9946589863564047 | 31060 |
| 0.9932174443132449 | 31070 |
| 0.9917781746392186 | 31080 |
| 0.9903411734636246 | 31090 |
| 0.9889064369228457 | 31100 |
| 0.9874739611603365 | 31110 |
| 0.9860437423266104 | 31120 |
| 0.9846157765792174 | 31130 |
| 0.9831900600827443 | 31140 |
| 0.981766589008791 | 31150 |
| 0.9803453595359595 | 31160 |
| 0.9789263678498402 | 31170 |
| 0.9775096101429984 | 31180 |
| 0.9760950826149601 | 31190 |
| 0.9746827814721994 | 31200 |
| 0.9732727029281235 | 31210 |
| 0.9718648432030603 | 31220 |
| 0.9704591985242443 | 31230 |
| 0.9690557651258039 | 31240 |
| 0.9676545392487469 | 31250 |
| 0.9662555171409468 | 31260 |
| 0.9648586950571316 | 31270 |
| 0.9634640692588675 | 31280 |
| 0.9620716360145479 | 31290 |
| 0.9606813915993784 | 31300 |
| 0.9592933322953647 | 31310 |
| 0.9579074543912988 | 31320 |
| 0.9565237541827453 | 31330 |
| 0.9551422279720294 | 31340 |
| 0.9537628720682223 | 31350 |
| 0.9523856827871291 | 31360 |
| 0.9510106564512772 | 31370 |
| 0.9496377893898951 | 31380 |
| 0.948267077938912 | 31390 |
| 0.9468985184409356 | 31400 |
| 0.945532107245242 | 31410 |
| 0.9441678407077626 | 31420 |
| 0.9428057151910705 | 31430 |
| 0.9414457270643681 | 31440 |
| 0.9400878727034744 | 31450 |
| 0.9387321484908115 | 31460 |
| 0.9373785508153921 | 31470 |
| 0.9360270760728063 | 31480 |
| 0.9346777206652097 | 31490 |
| 0.933330481001309 | 31500 |
| 0.9319853534963508 | 31510 |
| 0.9306423345721088 | 31520 |
| 0.9293014206568692 | 31530 |
| 0.9279626081854208 | 31540 |
| 0.9266258935990398 | 31550 |
| 0.9252912733454792 | 31560 |
| 0.9239587438789547 | 31570 |
| 0.9226283016601332 | 31580 |
| 0.9212999431561191 | 31590 |
| 0.9199736648404432 | 31600 |
| 0.9186494631930489 | 31610 |
| 0.9173273347002807 | 31620 |
| 0.916007275854873 | 31630 |
| 0.9146892831559302 | 31640 |
| 0.9133733531089264 | 31650 |
| 0.9120594822256839 | 31660 |
| 0.9107476670243647 | 31670 |
| 0.9094379040294562 | 31680 |
| 0.9081301897717612 | 31690 |
| 0.906824520788383 | 31700 |
| 0.9055208936227155 | 31710 |
| 0.904219304824429 | 31720 |
| 0.9029197509494602 | 31730 |
| 0.9016222285599976 | 31740 |
| 0.9003267342244715 | 31750 |
| 0.8990332645175405 | 31760 |
| 0.8977418160200801 | 31770 |
| 0.8964523853191699 | 31780 |
| 0.8951649690080828 | 31790 |
| 0.893879563686272 | 31800 |
| 0.892596165959359 | 31810 |
| 0.8913147724391219 | 31820 |
| 0.8900353797434842 | 31830 |
| 0.8887579844965008 | 31840 |
| 0.887482583328349 | 31850 |
| 0.8862091728753138 | 31860 |
| 0.8849377497797777 | 31870 |
| 0.8836683106902089 | 31880 |
| 0.882400852261151 | 31890 |
| 0.881135371153203 | 31900 |
| 0.8798718640330202 | 31910 |
| 0.8786103275732944 | 31920 |
| 0.8773507584527434 | 31930 |
| 0.8760931533560998 | 31940 |
| 0.8748375089741008 | 31950 |
| 0.873583822003474 | 31960 |
| 0.8723320891469275 | 31970 |
| 0.8710823071131373 | 31980 |
| 0.8698344726167371 | 31990 |
| 0.8685885823783058 | 32000 |
| 0.8673446331243558 | 32010 |
| 0.8661026215873224 | 32020 |
| 0.8648625445055511 | 32030 |
| 0.8636243986232878 | 32040 |
| 0.8623881806906658 | 32050 |
| 0.8611538874636956 | 32060 |
| 0.8599215157042528 | 32070 |
| 0.8586910621800667 | 32080 |
| 0.8574625236647103 | 32090 |
| 0.8562358969375866 | 32100 |
| 0.8550111787839196 | 32110 |
| 0.8537883659947424 | 32120 |
| 0.8525674553668849 | 32130 |
| 0.851348443702966 | 32140 |
| 0.8501313278113737 | 32150 |
| 0.8489161045062664 | 32160 |
| 0.8477027706075532 | 32170 |
| 0.8464913229408848 | 32180 |
| 0.8452817583376432 | 32190 |
| 0.8440740736349304 | 32200 |
| 0.8428682656755561 | 32210 |
| 0.841664331308028 | 32220 |
| 0.8404622673865411 | 32230 |
| 0.8392620707709653 | 32240 |
| 0.8380637383268359 | 32250 |
| 0.8368672669253416 | 32260 |
| 0.835672653443314 | 32270 |
| 0.8344798947632169 | 32280 |
| 0.8332889877731354 | 32290 |
| 0.8320999293667644 | 32300 |
| 0.8309127164433986 | 32310 |
| 0.829727345907922 | 32320 |
| 0.8285438146707955 | 32330 |
| 0.8273621196480477 | 32340 |
| 0.8261822577612642 | 32350 |
| 0.825004225937575 | 32360 |
| 0.8238280211096469 | 32370 |
| 0.8226536402156697 | 32380 |
| 0.8214810801993473 | 32390 |
| 0.8203103380098896 | 32400 |
| 0.8191414106019919 | 32410 |
| 0.8179742949358382 | 32420 |
| 0.8168089879770819 | 32430 |
| 0.8156454866968371 | 32440 |
| 0.814483788071668 | 32450 |
| 0.8133238890835794 | 32460 |
| 0.8121657867200054 | 32470 |
| 0.8110094779737985 | 32480 |
| 0.80985495984322 | 32490 |
| 0.8087022293319299 | 32500 |
| 0.8075512834489755 | 32510 |
| 0.8064021192087819 | 32520 |
| 0.8052547336311404 | 32530 |
| 0.8041091237412004 | 32540 |
| 0.8029652865694566 | 32550 |
| 0.8018232191517402 | 32560 |
| 0.8006829185292091 | 32570 |
| 0.7995443817483359 | 32580 |
| 0.7984076058608995 | 32590 |
| 0.7972725879239729 | 32600 |
| 0.7961393249999164 | 32610 |
| 0.7950078141563627 | 32620 |
| 0.7938780524662109 | 32630 |
| 0.7927500370076153 | 32640 |
| 0.7916237648639731 | 32650 |
| 0.7904992331239196 | 32660 |
| 0.789376438881308 | 32670 |
| 0.7882553792352128 | 32680 |
| 0.7871360512899094 | 32690 |
| 0.7860184521548694 | 32700 |
| 0.7849025789447482 | 32710 |
| 0.7837884287793758 | 32720 |
| 0.7826759987837469 | 32730 |
| 0.7815652860880113 | 32740 |
| 0.7804562878274636 | 32750 |
| 0.7793490011425331 | 32760 |
| 0.7782434231787745 | 32770 |
| 0.7771395510868582 | 32780 |
| 0.7760373820225599 | 32790 |
| 0.7749369131467511 | 32800 |
| 0.7738381416253893 | 32810 |
| 0.7727410646295082 | 32820 |
| 0.7716456793352083 | 32830 |
| 0.770551982923647 | 32840 |
| 0.7694599725810287 | 32850 |
| 0.7683696454985953 | 32860 |
| 0.7672809988726166 | 32870 |
| 0.7661940299043808 | 32880 |
| 0.7651087358001842 | 32890 |
| 0.7640251137713232 | 32900 |
| 0.7629431610340841 | 32910 |
| 0.7618628748097294 | 32920 |
| 0.7607842523244958 | 32930 |
| 0.75970729080958 | 32940 |
| 0.7586319875011304 | 32950 |
| 0.757558339640236 | 32960 |
| 0.7564863444729198 | 32970 |
| 0.7554159992501274 | 32980 |
| 0.7543473012277175 | 32990 |
| 0.7532802476664535 | 33000 |
| 0.7522148358319941 | 33010 |
| 0.7511510629948829 | 33020 |
| 0.7500889264305414 | 33030 |
| 0.7490284234192518 | 33040 |
| 0.7479695512461636 | 33050 |
| 0.7469123072012679 | 33060 |
| 0.7458566885793967 | 33070 |
| 0.7448026926802116 | 33080 |
| 0.7437503168081949 | 33090 |
| 0.7426995582726404 | 33100 |
| 0.7416504143876441 | 33110 |
| 0.7406028824720946 | 33120 |
| 0.739556959849665 | 33130 |
| 0.7385126438488032 | 33140 |
| 0.737469931802722 | 33150 |
| 0.7364288210493918 | 33160 |
| 0.735389308931531 | 33170 |
| 0.7343513927965923 | 33180 |
| 0.7333150699967629 | 33190 |
| 0.7322803378889481 | 33200 |
| 0.7312471938347649 | 33210 |
| 0.7302156352005326 | 33220 |
| 0.7291856593572642 | 33230 |
| 0.7281572636806574 | 33240 |
| 0.7271304455510843 | 33250 |
| 0.7261052023535852 | 33260 |
| 0.7250815314778574 | 33270 |
| 0.7240594303182467 | 33280 |
| 0.7230388962737415 | 33290 |
| 0.722019926747954 | 33300 |
| 0.7210025191491297 | 33310 |
| 0.7199866708901203 | 33320 |
| 0.7189723793883839 | 33330 |
| 0.717959642065975 | 33340 |
| 0.7169484563495354 | 33350 |
| 0.7159388196702872 | 33360 |
| 0.7149307294640153 | 33370 |
| 0.7139241831710762 | 33380 |
| 0.7129191782363717 | 33390 |
| 0.7119157121093503 | 33400 |
| 0.7109137822439939 | 33410 |
| 0.7099133860988126 | 33420 |
| 0.7089145211368352 | 33430 |
| 0.7079171848255947 | 33440 |
| 0.7069213746371311 | 33450 |
| 0.705927088047974 | 33460 |
| 0.7049343225391366 | 33470 |
| 0.7039430755961082 | 33480 |
| 0.7029533447088437 | 33490 |
| 0.701965127371757 | 33500 |
| 0.7009784210837112 | 33510 |
| 0.6999932233480116 | 33520 |
| 0.6990095316723951 | 33530 |
| 0.6980273435690239 | 33540 |
| 0.6970466565544775 | 33550 |
| 0.696067468149737 | 33560 |
| 0.6950897758801917 | 33570 |
| 0.6941135772756164 | 33580 |
| 0.6931388698701695 | 33590 |
| 0.6921656512023836 | 33600 |
| 0.6911939188151575 | 33610 |
| 0.6902236702557496 | 33620 |
| 0.6892549030757609 | 33630 |
| 0.6882876148311431 | 33640 |
| 0.6873218030821753 | 33650 |
| 0.686357465393462 | 33660 |
| 0.6853945993339251 | 33670 |
| 0.6844332024767942 | 33680 |
| 0.6834732723996009 | 33690 |
| 0.6825148066841641 | 33700 |
| 0.6815578029165915 | 33710 |
| 0.6806022586872652 | 33720 |
| 0.6796481715908348 | 33730 |
| 0.6786955392262093 | 33740 |
| 0.6777443591965496 | 33750 |
| 0.6767946291092601 | 33760 |
| 0.6758463465759806 | 33770 |
| 0.6748995092125782 | 33780 |
| 0.6739541146391401 | 33790 |
| 0.6730101604799656 | 33800 |
| 0.6720676443635535 | 33810 |
| 0.6711265639226013 | 33820 |
| 0.6701869167939966 | 33830 |
| 0.6692487006188029 | 33840 |
| 0.6683119130422562 | 33850 |
| 0.6673765517137571 | 33860 |
| 0.6664426142868632 | 33870 |
| 0.6655100984192763 | 33880 |
| 0.6645790017728409 | 33890 |
| 0.6636493220135375 | 33900 |
| 0.6627210568114666 | 33910 |
| 0.6617942038408471 | 33920 |
| 0.6608687607800069 | 33930 |
| 0.6599447253113774 | 33940 |
| 0.6590220951214778 | 33950 |
| 0.6581008679009193 | 33960 |
| 0.6571810413443882 | 33970 |
| 0.6562626131506424 | 33980 |
| 0.6553455810225021 | 33990 |
| 0.6544299426668425 | 34000 |
| 0.6535156957945866 | 34010 |
| 0.6526028381206967 | 34020 |
| 0.6516913673641681 | 34030 |
| 0.6507812812480194 | 34040 |
| 0.6498725774992876 | 34050 |
| 0.6489652538490196 | 34060 |
| 0.6480593080322603 | 34070 |
| 0.6471547377880511 | 34080 |
| 0.6462515408594239 | 34090 |
| 0.6453497149933849 | 34100 |
| 0.644449257940914 | 34110 |
| 0.6435501674569547 | 34120 |
| 0.6426524413004092 | 34130 |
| 0.6417560772341245 | 34140 |
| 0.6408610730248926 | 34150 |
| 0.6399674264434426 | 34160 |
| 0.6390751352644262 | 34170 |
| 0.6381841972664163 | 34180 |
| 0.6372946102318985 | 34190 |
| 0.6364063719472639 | 34200 |
| 0.6355194802027974 | 34210 |
| 0.6346339327926785 | 34220 |
| 0.6337497275149678 | 34230 |
| 0.6328668621716013 | 34240 |
| 0.6319853345683837 | 34250 |
| 0.6311051425149806 | 34260 |
| 0.6302262838249112 | 34270 |
| 0.6293487563155413 | 34280 |
| 0.6284725578080756 | 34290 |
| 0.6275976861275514 | 34300 |
| 0.6267241391028303 | 34310 |
| 0.6258519145665933 | 34320 |
| 0.6249810103553272 | 34330 |
| 0.6241114243093252 | 34340 |
| 0.6232431542726796 | 34350 |
| 0.6223761980932667 | 34360 |
| 0.6215105536227471 | 34370 |
| 0.6206462187165555 | 34380 |
| 0.6197831912338957 | 34390 |
| 0.6189214690377283 | 34400 |
| 0.6180610499947695 | 34410 |
| 0.6172019319754858 | 34420 |
| 0.6163441128540779 | 34430 |
| 0.6154875905084809 | 34440 |
| 0.6146323628203554 | 34450 |
| 0.6137784276750811 | 34460 |
| 0.6129257829617462 | 34470 |
| 0.612074426573146 | 34480 |
| 0.6112243564057737 | 34490 |
| 0.610375570359811 | 34500 |
| 0.6095280663391253 | 34510 |
| 0.6086818422512593 | 34520 |
| 0.6078368960074262 | 34530 |
| 0.6069932255225021 | 34540 |
| 0.606150828715019 | 34550 |
| 0.6053097035071583 | 34560 |
| 0.604469847824745 | 34570 |
| 0.6036312595972362 | 34580 |
| 0.6027939367577209 | 34590 |
| 0.6019578772429078 | 34600 |
| 0.6011230789931251 | 34610 |
| 0.6002895399523049 | 34620 |
| 0.5994572580679824 | 34630 |
| 0.5986262312912893 | 34640 |
| 0.5977964575769411 | 34650 |
| 0.5969679348832387 | 34660 |
| 0.5961406611720556 | 34670 |
| 0.5953146344088366 | 34680 |
| 0.5944898525625842 | 34690 |
| 0.5936663136058576 | 34700 |
| 0.592844015514764 | 34710 |
| 0.5920229562689487 | 34720 |
| 0.5912031338515966 | 34730 |
| 0.5903845462494176 | 34740 |
| 0.5895671914526449 | 34750 |
| 0.5887510674550254 | 34760 |
| 0.5879361722538154 | 34770 |
| 0.587122503849772 | 34780 |
| 0.5863100602471489 | 34790 |
| 0.5854988394536872 | 34800 |
| 0.5846888394806111 | 34810 |
| 0.5838800583426204 | 34820 |
| 0.583072494057885 | 34830 |
| 0.582266144648034 | 34840 |
| 0.5814610081381566 | 34850 |
| 0.5806570825567893 | 34860 |
| 0.5798543659359157 | 34870 |
| 0.5790528563109526 | 34880 |
| 0.5782525517207485 | 34890 |
| 0.5774534502075775 | 34900 |
| 0.5766555498171271 | 34910 |
| 0.5758588485985007 | 34920 |
| 0.5750633446042034 | 34930 |
| 0.5742690358901433 | 34940 |
| 0.5734759205156168 | 34950 |
| 0.5726839965433074 | 34960 |
| 0.5718932620392794 | 34970 |
| 0.571103715072967 | 34980 |
| 0.5703153537171747 | 34990 |
| 0.5695281760480669 | 35000 |
| 0.5687421801451625 | 35010 |
| 0.5679573640913287 | 35020 |
| 0.567173725972774 | 35030 |
| 0.5663912638790436 | 35040 |
| 0.5656099759030115 | 35050 |
| 0.5648298601408757 | 35060 |
| 0.5640509146921505 | 35070 |
| 0.563273137659662 | 35080 |
| 0.5624965271495422 | 35090 |
| 0.561721081271217 | 35100 |
| 0.56094679813741 | 35110 |
| 0.5601736758641278 | 35120 |
| 0.5594017125706613 | 35130 |
| 0.5586309063795711 | 35140 |
| 0.5578612554166884 | 35150 |
| 0.5570927578111063 | 35160 |
| 0.556325411695171 | 35170 |
| 0.5555592152044817 | 35180 |
| 0.554794166477879 | 35190 |
| 0.554030263657445 | 35200 |
| 0.5532675048884901 | 35210 |
| 0.5525058883195508 | 35220 |
| 0.5517454121023857 | 35230 |
| 0.5509860743919625 | 35240 |
| 0.5502278733464608 | 35250 |
| 0.5494708071272606 | 35260 |
| 0.5487148738989379 | 35270 |
| 0.5479600718292582 | 35280 |
| 0.5472063990891715 | 35290 |
| 0.5464538538528052 | 35300 |
| 0.5457024342974596 | 35310 |
| 0.5449521386036004 | 35320 |
| 0.5442029649548542 | 35330 |
| 0.5434549115380037 | 35340 |
| 0.5427079765429758 | 35350 |
| 0.5419621581628439 | 35360 |
| 0.5412174545938175 | 35370 |
| 0.5404738640352365 | 35380 |
| 0.5397313846895682 | 35390 |
| 0.5389900147623974 | 35400 |
| 0.538249752462424 | 35410 |
| 0.537510596001453 | 35420 |
| 0.5367725435943946 | 35430 |
| 0.5360355934592542 | 35440 |
| 0.5352997438171275 | 35450 |
| 0.5345649928921979 | 35460 |
| 0.5338313389117245 | 35470 |
| 0.5330987801060426 | 35480 |
| 0.5323673147085519 | 35490 |
| 0.5316369409557175 | 35500 |
| 0.5309076570870598 | 35510 |
| 0.5301794613451497 | 35520 |
| 0.5294523519756043 | 35530 |
| 0.528726327227079 | 35540 |
| 0.5280013853512637 | 35550 |
| 0.5272775246028764 | 35560 |
| 0.5265547432396577 | 35570 |
| 0.5258330395223653 | 35580 |
| 0.5251124117147684 | 35590 |
| 0.524392858083643 | 35600 |
| 0.5236743768987623 | 35610 |
| 0.5229569664328974 | 35620 |
| 0.5222406249618078 | 35630 |
| 0.5215253507642351 | 35640 |
| 0.5208111421219029 | 35650 |
| 0.5200979973195037 | 35660 |
| 0.5193859146447 | 35670 |
| 0.5186748923881114 | 35680 |
| 0.5179649288433185 | 35690 |
| 0.5172560223068505 | 35700 |
| 0.5165481710781811 | 35710 |
| 0.5158413734597274 | 35720 |
| 0.5151356277568369 | 35730 |
| 0.5144309322777888 | 35740 |
| 0.5137272853337824 | 35750 |
| 0.5130246852389385 | 35760 |
| 0.5123231303102893 | 35770 |
| 0.5116226188677746 | 35780 |
| 0.5109231492342361 | 35790 |
| 0.5102247197354124 | 35800 |
| 0.5095273286999328 | 35810 |
| 0.5088309744593134 | 35820 |
| 0.5081356553479496 | 35830 |
| 0.5074413697031138 | 35840 |
| 0.5067481158649472 | 35850 |
| 0.5060558921764572 | 35860 |
| 0.5053646969835068 | 35870 |
| 0.5046745286348174 | 35880 |
| 0.5039853854819575 | 35890 |
| 0.5032972658793379 | 35900 |
| 0.5026101681842114 | 35910 |
| 0.5019240907566612 | 35920 |
| 0.5012390319595995 | 35930 |
| 0.5005549901587586 | 35940 |
| 0.4998719637226913 | 35950 |
| 0.49918995102276165 | 35960 |
| 0.49850895043314 | 35970 |
| 0.4978289603308012 | 35980 |
| 0.49714997909551445 | 35990 |
| 0.4964720051098422 | 36000 |
| 0.4957950367591302 | 36010 |
| 0.49511907243150877 | 36020 |
| 0.4944441105178836 | 36030 |
| 0.49377014941193115 | 36040 |
| 0.4930971875100941 | 36050 |
| 0.492425223211576 | 36060 |
| 0.4917542549183361 | 36070 |
| 0.4910842810350846 | 36080 |
| 0.490415299969277 | 36090 |
| 0.48974731013111 | 36100 |
| 0.4890803099335154 | 36110 |
| 0.488414297792157 | 36120 |
| 0.4877492721254203 | 36130 |
| 0.48708523135441556 | 36140 |
| 0.48642217390296616 | 36150 |
| 0.4857600981976061 | 36160 |
| 0.48509900266757755 | 36170 |
| 0.48443888574481997 | 36180 |
| 0.48377974586397104 | 36190 |
| 0.4831215814623551 | 36200 |
| 0.48246439097998606 | 36210 |
| 0.48180817285955746 | 36220 |
| 0.4811529255464371 | 36230 |
| 0.48049864748866733 | 36240 |
| 0.4798453371369542 | 36250 |
| 0.4791929929446628 | 36260 |
| 0.47854161336781775 | 36270 |
| 0.4778911968650937 | 36280 |
| 0.47724174189781177 | 36290 |
| 0.476593246929935 | 36300 |
| 0.47594571042806294 | 36310 |
| 0.47529913086142717 | 36320 |
| 0.47465350670188605 | 36330 |
| 0.47400883642392094 | 36340 |
| 0.4733651185046299 | 36350 |
| 0.47272235142372404 | 36360 |
| 0.47208053366352304 | 36370 |
| 0.47143966370894713 | 36380 |
| 0.47079974004751735 | 36390 |
| 0.4701607611693476 | 36400 |
| 0.46952272556714036 | 36410 |
| 0.46888563173618125 | 36420 |
| 0.46824947817433843 | 36430 |
| 0.4676142633820522 | 36440 |
| 0.46697998586233075 | 36450 |
| 0.46634664412075083 | 36460 |
| 0.46571423666544826 | 36470 |
| 0.4650827620071146 | 36480 |
| 0.46445221865899183 | 36490 |
| 0.46382260513687085 | 36500 |
| 0.4631939199590828 | 36510 |
| 0.4625661616464934 | 36520 |
| 0.46193932872250415 | 36530 |
| 0.46131341971304296 | 36540 |
| 0.46068843314656177 | 36550 |
| 0.46006436755402996 | 36560 |
| 0.45944122146893135 | 36570 |
| 0.4588189934272597 | 36580 |
| 0.45819768196751226 | 36590 |
| 0.45757728563068734 | 36600 |
| 0.4569578029602788 | 36610 |
| 0.45633923250227126 | 36620 |
| 0.45572157280513687 | 36630 |
| 0.45510482241982664 | 36640 |
| 0.45448897989977227 | 36650 |
| 0.45387404380087676 | 36660 |
| 0.45326001268151234 | 36670 |
| 0.452646885102514 | 36680 |
| 0.4520346596271759 | 36690 |
| 0.45142333482125047 | 36700 |
| 0.45081290925293466 | 36710 |
| 0.45020338149287564 | 36720 |
| 0.44959475011416056 | 36730 |
| 0.44898701369231336 | 36740 |
| 0.4483801708052901 | 36750 |
| 0.4477742200334773 | 36760 |
| 0.4471691599596832 | 36770 |
| 0.4465649891691336 | 36780 |
| 0.44596170624947146 | 36790 |
| 0.4453593097907497 | 36800 |
| 0.44475779838542684 | 36810 |
| 0.4441571706283633 | 36820 |
| 0.44355742511681595 | 36830 |
| 0.4429585604504355 | 36840 |
| 0.4423605752312605 | 36850 |
| 0.44176346806371364 | 36860 |
| 0.44116723755459736 | 36870 |
| 0.4405718823130897 | 36880 |
| 0.43997740095074056 | 36890 |
| 0.4393837920814638 | 36900 |
| 0.43879105432153864 | 36910 |
| 0.43819918628960103 | 36920 |
| 0.43760818660664186 | 36930 |
| 0.43701805389600007 | 36940 |
| 0.4364287867833604 | 36950 |
| 0.4358403838967511 | 36960 |
| 0.4352528438665324 | 36970 |
| 0.43466616532540037 | 36980 |
| 0.4340803469083783 | 36990 |
| 0.43349538725281367 | 37000 |
| 0.4329112849983728 | 37010 |
| 0.4323280387870403 | 37020 |
| 0.43174564726310993 | 37030 |
| 0.4311641090731812 | 37040 |
| 0.4305834228661589 | 37050 |
| 0.43000358729324584 | 37060 |
| 0.4294246010079394 | 37070 |
| 0.42884646266602716 | 37080 |
| 0.42826917092558325 | 37090 |
| 0.42769272444696316 | 37100 |
| 0.4271171218928012 | 37110 |
| 0.4265423619280046 | 37120 |
| 0.4259684432197504 | 37130 |
| 0.4253953644374827 | 37140 |
| 0.4248231242529032 | 37150 |
| 0.4242517213399744 | 37160 |
| 0.42368115437491055 | 37170 |
| 0.4231114220361757 | 37180 |
| 0.4225425230044776 | 37190 |
| 0.42197445596276606 | 37200 |
| 0.4214072195962275 | 37210 |
| 0.4208408125922808 | 37220 |
| 0.4202752336405734 | 37230 |
| 0.4197104814329781 | 37240 |
| 0.41914655466358763 | 37250 |
| 0.41858345202871183 | 37260 |
| 0.41802117222687196 | 37270 |
| 0.4174597139588014 | 37280 |
| 0.41689907592743264 | 37290 |
| 0.4163392568379027 | 37300 |
| 0.41578025539754393 | 37310 |
| 0.41522207031588115 | 37320 |
| 0.41466470030462826 | 37330 |
| 0.4141081440776831 | 37340 |
| 0.4135524003511247 | 37350 |
| 0.4129974678432089 | 37360 |
| 0.4124433452743637 | 37370 |
| 0.41189003136718644 | 37380 |
| 0.41133752484643904 | 37390 |
| 0.4107858244390456 | 37400 |
| 0.41023492887408447 | 37410 |
| 0.40968483688278995 | 37420 |
| 0.4091355471985441 | 37430 |
| 0.40858705855687505 | 37440 |
| 0.4080393696954522 | 37450 |
| 0.4074924793540822 | 37460 |
| 0.40694638627470586 | 37470 |
| 0.40640108920139373 | 37480 |
| 0.4058565868803422 | 37490 |
| 0.40531287805986976 | 37500 |
| 0.40476996149041367 | 37510 |
| 0.40422783592452505 | 37520 |
| 0.4036865001168652 | 37530 |
| 0.4031459528242057 | 37540 |
| 0.4026061928054159 | 37550 |
| 0.40206721882146773 | 37560 |
| 0.4015290296354275 | 37570 |
| 0.4009916240124539 | 37580 |
| 0.4004550007197926 | 37590 |
| 0.3999191585267737 | 37600 |
| 0.39938409620480786 | 37610 |
| 0.3988498125273817 | 37620 |
| 0.39831630627005526 | 37630 |
| 0.39778357621045707 | 37640 |
| 0.39725162112828133 | 37650 |
| 0.3967204398052845 | 37660 |
| 0.3961900310252785 | 37670 |
| 0.39566039357413174 | 37680 |
| 0.3951315262397621 | 37690 |
| 0.39460342781213475 | 37700 |
| 0.39407609708325714 | 37710 |
| 0.39354953284717653 | 37720 |
| 0.39302373389997575 | 37730 |
| 0.3924986990397696 | 37740 |
| 0.3919744270667011 | 37750 |
| 0.3914509167829378 | 37760 |
| 0.3909281669926687 | 37770 |
| 0.39040617650209974 | 37780 |
| 0.38988494411944985 | 37790 |
| 0.3893644686549514 | 37800 |
| 0.3888447489208383 | 37810 |
| 0.38832578373135035 | 37820 |
| 0.3878075719027262 | 37830 |
| 0.3872901122531994 | 37840 |
| 0.3867734036029964 | 37850 |
| 0.3862574447743313 | 37860 |
| 0.3857422345914037 | 37870 |
| 0.385227771880394 | 37880 |
| 0.38471405546946014 | 37890 |
| 0.3842010841887351 | 37900 |
| 0.38368885687032234 | 37910 |
| 0.38317737234829014 | 37920 |
| 0.3826666294586729 | 37930 |
| 0.382156627039464 | 37940 |
| 0.38164736393061355 | 37950 |
| 0.3811388389740238 | 37960 |
| 0.3806310510135473 | 37970 |
| 0.38012399889498194 | 37980 |
| 0.3796176814660681 | 37990 |
| 0.37911209757648506 | 38000 |
| 0.37860724607784746 | 38010 |
| 0.37810312582370165 | 38020 |
| 0.37759973566952293 | 38030 |
| 0.37709707447271096 | 38040 |
| 0.3765951410925873 | 38050 |
| 0.37609393439039157 | 38060 |
| 0.37559345322927756 | 38070 |
| 0.3750936964743106 | 38080 |
| 0.37459466299246386 | 38090 |
| 0.37409635165261423 | 38100 |
| 0.37359876132554004 | 38110 |
| 0.3731018908839166 | 38120 |
| 0.3726057392023138 | 38130 |
| 0.37211030515719173 | 38140 |
| 0.37161558762689784 | 38150 |
| 0.3711215854916632 | 38160 |
| 0.3706282976336009 | 38170 |
| 0.37013572293669766 | 38180 |
| 0.3696438602868171 | 38190 |
| 0.36915270857169225 | 38200 |
| 0.368662266680923 | 38210 |
| 0.36817253350597273 | 38220 |
| 0.3676835079401656 | 38230 |
| 0.36719518887868224 | 38240 |
| 0.3667075752185564 | 38250 |
| 0.36622066585867447 | 38260 |
| 0.3657344596997674 | 38270 |
| 0.3652489556444106 | 38280 |
| 0.36476415259701983 | 38290 |
| 0.36428004946384807 | 38300 |
| 0.3637966451529825 | 38310 |
| 0.3633139385743389 | 38320 |
| 0.36283192863966224 | 38330 |
| 0.3623506142625209 | 38340 |
| 0.3618699943583036 | 38350 |
| 0.3613900678442167 | 38360 |
| 0.3609108336392808 | 38370 |
| 0.36043229066432686 | 38380 |
| 0.35995443784199427 | 38390 |
| 0.35947727409672603 | 38400 |
| 0.3590007983547669 | 38410 |
| 0.3585250095441593 | 38420 |
| 0.3580499065947411 | 38430 |
| 0.3575754884381397 | 38440 |
| 0.35710175400777283 | 38450 |
| 0.3566287022388426 | 38460 |
| 0.3561563320683331 | 38470 |
| 0.355684642435007 | 38480 |
| 0.35521363227940267 | 38490 |
| 0.354743300543831 | 38500 |
| 0.3542736461723718 | 38510 |
| 0.35380466811087075 | 38520 |
| 0.3533363653069368 | 38530 |
| 0.3528687367099384 | 38540 |
| 0.3524017812710016 | 38550 |
| 0.35193549794300294 | 38560 |
| 0.3514698856805716 | 38570 |
| 0.3510049434400848 | 38580 |
| 0.350540670179662 | 38590 |
| 0.35007706485916407 | 38600 |
| 0.3496141264401896 | 38610 |
| 0.3491518538860722 | 38620 |
| 0.348690246161877 | 38630 |
| 0.34822930223439724 | 38640 |
| 0.3477690210721525 | 38650 |
| 0.34730940164538365 | 38660 |
| 0.34685044292605155 | 38670 |
| 0.34639214388783396 | 38680 |
| 0.34593450350611904 | 38690 |
| 0.3454775207580078 | 38700 |
| 0.3450211946223074 | 38710 |
| 0.34456552407952895 | 38720 |
| 0.34411050811188443 | 38730 |
| 0.34365614570328384 | 38740 |
| 0.3432024358393318 | 38750 |
| 0.3427493775073253 | 38760 |
| 0.342296969696249 | 38770 |
| 0.3418452113967757 | 38780 |
| 0.3413941016012591 | 38790 |
| 0.3409436393037329 | 38800 |
| 0.34049382349990803 | 38810 |
| 0.34004465318716975 | 38820 |
| 0.33959612736457245 | 38830 |
| 0.33914824503284013 | 38840 |
| 0.3387010051943611 | 38850 |
| 0.33825440685318553 | 38860 |
| 0.3378084490150226 | 38870 |
| 0.33736313068723783 | 38880 |
| 0.33691845087884925 | 38890 |
| 0.33647440860052547 | 38900 |
| 0.33603100286458226 | 38910 |
| 0.3355882326849791 | 38920 |
| 0.3351460970773178 | 38930 |
| 0.33470459505883826 | 38940 |
| 0.33426372564841433 | 38950 |
| 0.3338234878665545 | 38960 |
| 0.3333838807353962 | 38970 |
| 0.3329449032787036 | 38980 |
| 0.3325065545218647 | 38990 |
| 0.3320688334918885 | 39000 |
| 0.3316317392174024 | 39010 |
| 0.3311952707286487 | 39020 |
| 0.330759427057482 | 39030 |
| 0.3303242072373666 | 39040 |
| 0.3298896103033736 | 39050 |
| 0.3294556352921784 | 39060 |
| 0.3290222812420549 | 39070 |
| 0.3285895471928778 | 39080 |
| 0.3281574321861152 | 39090 |
| 0.32772593526482985 | 39100 |
| 0.32729505547367216 | 39110 |
| 0.32686479185887946 | 39120 |
| 0.3264351434682734 | 39130 |
| 0.32600610935125707 | 39140 |
| 0.32557768855881136 | 39150 |
| 0.3251498801434928 | 39160 |
| 0.3247226831594306 | 39170 |
| 0.324296096662324 | 39180 |
| 0.32387011970943963 | 39190 |
| 0.32344475135960865 | 39200 |
| 0.3230199906732219 | 39210 |
| 0.3225958367122314 | 39220 |
| 0.3221722885401443 | 39230 |
| 0.3217493452220209 | 39240 |
| 0.3213270058244721 | 39250 |
| 0.320905269415657 | 39260 |
| 0.320484135065279 | 39270 |
| 0.32006360184458443 | 39280 |
| 0.31964366882635814 | 39290 |
| 0.31922433508492426 | 39300 |
| 0.31880559969613825 | 39310 |
| 0.3183874617373883 | 39320 |
| 0.31796992028759125 | 39330 |
| 0.3175529744271901 | 39340 |
| 0.31713662323814973 | 39350 |
| 0.31672086580395703 | 39360 |
| 0.31630570120961626 | 39370 |
| 0.315891128541647 | 39380 |
| 0.31547714688808154 | 39390 |
| 0.3150637553384614 | 39400 |
| 0.3146509529838359 | 39410 |
| 0.3142387389167581 | 39420 |
| 0.31382711223128346 | 39430 |
| 0.31341607202296673 | 39440 |
| 0.31300561738885846 | 39450 |
| 0.31259574742750446 | 39460 |
| 0.3121864612389392 | 39470 |
| 0.31177775792468804 | 39480 |
| 0.3113696365877617 | 39490 |
| 0.3109620963326539 | 39500 |
| 0.3105551362653394 | 39510 |
| 0.31014875549327064 | 39520 |
| 0.30974295312537586 | 39530 |
| 0.3093377282720561 | 39540 |
| 0.30893308004518266 | 39550 |
| 0.3085290075580942 | 39560 |
| 0.3081255099255954 | 39570 |
| 0.3077225862639516 | 39580 |
| 0.30732023569088956 | 39590 |
| 0.30691845732559286 | 39600 |
| 0.3065172502886993 | 39610 |
| 0.30611661370230075 | 39620 |
| 0.30571654668993675 | 39630 |
| 0.3053170483765941 | 39640 |
| 0.3049181178887048 | 39650 |
| 0.30451975435414247 | 39660 |
| 0.30412195690221994 | 39670 |
| 0.30372472466368683 | 39680 |
| 0.3033280567707277 | 39690 |
| 0.30293195235695847 | 39700 |
| 0.3025364105574244 | 39710 |
| 0.3021414305085968 | 39720 |
| 0.30174701134837223 | 39730 |
| 0.30135315221606856 | 39740 |
| 0.3009598522524226 | 39750 |
| 0.30056711059958835 | 39760 |
| 0.3001749264011339 | 39770 |
| 0.2997832988020386 | 39780 |
| 0.29939222694869144 | 39790 |
| 0.29900170998888814 | 39800 |
| 0.2986117470718278 | 39810 |
| 0.29822233734811354 | 39820 |
| 0.29783347996974546 | 39830 |
| 0.2974451740901216 | 39840 |
| 0.2970574188640345 | 39850 |
| 0.2966702134476672 | 39860 |
| 0.2962835569985941 | 39870 |
| 0.29589744867577555 | 39880 |
| 0.29551188763955694 | 39890 |
| 0.2951268730516657 | 39900 |
| 0.2947424040752089 | 39910 |
| 0.2943584798746708 | 39920 |
| 0.29397509961591084 | 39930 |
| 0.2935922624661606 | 39940 |
| 0.29320996759402185 | 39950 |
| 0.2928282141694639 | 39960 |
| 0.2924470013638222 | 39970 |
| 0.2920663283497926 | 39980 |
| 0.2916861943014338 | 39990 |
| 0.2913065983941615 | 40000 |